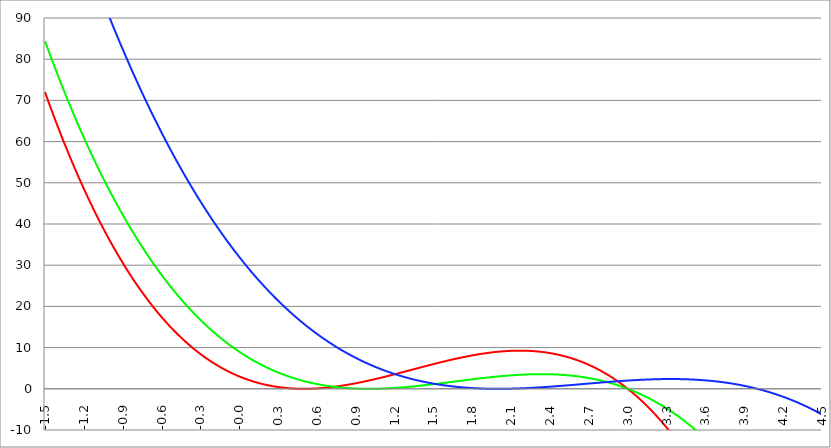
| Category | Series 1 | Series 0 | Series 2 |
|---|---|---|---|
| -1.5 | 72 | 84.375 | 134.75 |
| -1.497 | 71.736 | 84.117 | 134.446 |
| -1.494 | 71.473 | 83.859 | 134.142 |
| -1.491 | 71.211 | 83.601 | 133.839 |
| -1.488 | 70.949 | 83.344 | 133.536 |
| -1.485000000000001 | 70.688 | 83.088 | 133.233 |
| -1.482000000000001 | 70.427 | 82.832 | 132.931 |
| -1.479000000000001 | 70.167 | 82.576 | 132.63 |
| -1.476000000000001 | 69.908 | 82.321 | 132.328 |
| -1.473000000000001 | 69.649 | 82.067 | 132.028 |
| -1.470000000000001 | 69.39 | 81.813 | 131.727 |
| -1.467000000000001 | 69.133 | 81.56 | 131.428 |
| -1.464000000000001 | 68.876 | 81.307 | 131.128 |
| -1.461000000000001 | 68.619 | 81.054 | 130.829 |
| -1.458000000000001 | 68.364 | 80.803 | 130.531 |
| -1.455000000000002 | 68.108 | 80.551 | 130.233 |
| -1.452000000000002 | 67.854 | 80.3 | 129.935 |
| -1.449000000000002 | 67.6 | 80.05 | 129.638 |
| -1.446000000000002 | 67.347 | 79.8 | 129.342 |
| -1.443000000000002 | 67.094 | 79.551 | 129.045 |
| -1.440000000000002 | 66.842 | 79.302 | 128.75 |
| -1.437000000000002 | 66.59 | 79.054 | 128.454 |
| -1.434000000000002 | 66.339 | 78.806 | 128.159 |
| -1.431000000000002 | 66.089 | 78.558 | 127.865 |
| -1.428000000000003 | 65.839 | 78.312 | 127.571 |
| -1.425000000000003 | 65.59 | 78.065 | 127.277 |
| -1.422000000000003 | 65.341 | 77.819 | 126.984 |
| -1.419000000000003 | 65.093 | 77.574 | 126.691 |
| -1.416000000000003 | 64.846 | 77.329 | 126.399 |
| -1.413000000000003 | 64.599 | 77.085 | 126.107 |
| -1.410000000000003 | 64.352 | 76.841 | 125.816 |
| -1.407000000000003 | 64.107 | 76.598 | 125.525 |
| -1.404000000000003 | 63.862 | 76.355 | 125.235 |
| -1.401000000000004 | 63.617 | 76.113 | 124.945 |
| -1.398000000000004 | 63.373 | 75.871 | 124.655 |
| -1.395000000000004 | 63.13 | 75.629 | 124.366 |
| -1.392000000000004 | 62.888 | 75.389 | 124.077 |
| -1.389000000000004 | 62.645 | 75.148 | 123.789 |
| -1.386000000000004 | 62.404 | 74.908 | 123.501 |
| -1.383000000000004 | 62.163 | 74.669 | 123.214 |
| -1.380000000000004 | 61.923 | 74.43 | 122.927 |
| -1.377000000000004 | 61.683 | 74.192 | 122.64 |
| -1.374000000000004 | 61.444 | 73.954 | 122.354 |
| -1.371000000000005 | 61.205 | 73.717 | 122.068 |
| -1.368000000000005 | 60.967 | 73.48 | 121.783 |
| -1.365000000000005 | 60.73 | 73.243 | 121.498 |
| -1.362000000000005 | 60.493 | 73.007 | 121.214 |
| -1.359000000000005 | 60.257 | 72.772 | 120.93 |
| -1.356000000000005 | 60.021 | 72.537 | 120.646 |
| -1.353000000000005 | 59.786 | 72.303 | 120.363 |
| -1.350000000000005 | 59.552 | 72.069 | 120.081 |
| -1.347000000000005 | 59.318 | 71.835 | 119.799 |
| -1.344000000000006 | 59.084 | 71.602 | 119.517 |
| -1.341000000000006 | 58.851 | 71.37 | 119.235 |
| -1.338000000000006 | 58.619 | 71.138 | 118.955 |
| -1.335000000000006 | 58.388 | 70.906 | 118.674 |
| -1.332000000000006 | 58.157 | 70.675 | 118.394 |
| -1.329000000000006 | 57.926 | 70.445 | 118.115 |
| -1.326000000000006 | 57.696 | 70.215 | 117.835 |
| -1.323000000000006 | 57.467 | 69.985 | 117.557 |
| -1.320000000000006 | 57.238 | 69.756 | 117.278 |
| -1.317000000000007 | 57.01 | 69.527 | 117 |
| -1.314000000000007 | 56.783 | 69.299 | 116.723 |
| -1.311000000000007 | 56.556 | 69.072 | 116.446 |
| -1.308000000000007 | 56.329 | 68.844 | 116.169 |
| -1.305000000000007 | 56.103 | 68.618 | 115.893 |
| -1.302000000000007 | 55.878 | 68.392 | 115.618 |
| -1.299000000000007 | 55.653 | 68.166 | 115.342 |
| -1.296000000000007 | 55.429 | 67.941 | 115.067 |
| -1.293000000000007 | 55.205 | 67.716 | 114.793 |
| -1.290000000000008 | 54.982 | 67.492 | 114.519 |
| -1.287000000000008 | 54.76 | 67.268 | 114.245 |
| -1.284000000000008 | 54.538 | 67.044 | 113.972 |
| -1.281000000000008 | 54.317 | 66.822 | 113.7 |
| -1.278000000000008 | 54.096 | 66.599 | 113.427 |
| -1.275000000000008 | 53.876 | 66.377 | 113.155 |
| -1.272000000000008 | 53.656 | 66.156 | 112.884 |
| -1.269000000000008 | 53.437 | 65.935 | 112.613 |
| -1.266000000000008 | 53.218 | 65.715 | 112.342 |
| -1.263000000000009 | 53 | 65.495 | 112.072 |
| -1.260000000000009 | 52.783 | 65.275 | 111.802 |
| -1.257000000000009 | 52.566 | 65.056 | 111.533 |
| -1.254000000000009 | 52.35 | 64.838 | 111.264 |
| -1.251000000000009 | 52.134 | 64.619 | 110.996 |
| -1.24800000000001 | 51.919 | 64.402 | 110.728 |
| -1.245000000000009 | 51.705 | 64.185 | 110.46 |
| -1.242000000000009 | 51.49 | 63.968 | 110.193 |
| -1.239000000000009 | 51.277 | 63.752 | 109.926 |
| -1.23600000000001 | 51.064 | 63.536 | 109.66 |
| -1.23300000000001 | 50.852 | 63.321 | 109.394 |
| -1.23000000000001 | 50.64 | 63.106 | 109.128 |
| -1.22700000000001 | 50.429 | 62.892 | 108.863 |
| -1.22400000000001 | 50.218 | 62.678 | 108.598 |
| -1.22100000000001 | 50.008 | 62.465 | 108.334 |
| -1.21800000000001 | 49.798 | 62.252 | 108.07 |
| -1.21500000000001 | 49.589 | 62.039 | 107.807 |
| -1.21200000000001 | 49.381 | 61.827 | 107.544 |
| -1.20900000000001 | 49.173 | 61.616 | 107.281 |
| -1.206000000000011 | 48.965 | 61.405 | 107.019 |
| -1.203000000000011 | 48.758 | 61.194 | 106.757 |
| -1.200000000000011 | 48.552 | 60.984 | 106.496 |
| -1.197000000000011 | 48.346 | 60.774 | 106.235 |
| -1.194000000000011 | 48.141 | 60.565 | 105.975 |
| -1.191000000000011 | 47.936 | 60.356 | 105.715 |
| -1.188000000000011 | 47.732 | 60.148 | 105.455 |
| -1.185000000000011 | 47.529 | 59.94 | 105.196 |
| -1.182000000000011 | 47.326 | 59.733 | 104.937 |
| -1.179000000000012 | 47.123 | 59.526 | 104.678 |
| -1.176000000000012 | 46.921 | 59.32 | 104.42 |
| -1.173000000000012 | 46.72 | 59.114 | 104.163 |
| -1.170000000000012 | 46.519 | 58.908 | 103.906 |
| -1.167000000000012 | 46.319 | 58.703 | 103.649 |
| -1.164000000000012 | 46.119 | 58.499 | 103.393 |
| -1.161000000000012 | 45.919 | 58.295 | 103.137 |
| -1.158000000000012 | 45.721 | 58.091 | 102.881 |
| -1.155000000000012 | 45.523 | 57.888 | 102.626 |
| -1.152000000000013 | 45.325 | 57.685 | 102.371 |
| -1.149000000000013 | 45.128 | 57.483 | 102.117 |
| -1.146000000000013 | 44.931 | 57.281 | 101.863 |
| -1.143000000000013 | 44.735 | 57.08 | 101.61 |
| -1.140000000000013 | 44.54 | 56.879 | 101.357 |
| -1.137000000000013 | 44.345 | 56.678 | 101.104 |
| -1.134000000000013 | 44.15 | 56.478 | 100.852 |
| -1.131000000000013 | 43.957 | 56.279 | 100.6 |
| -1.128000000000013 | 43.763 | 56.08 | 100.349 |
| -1.125000000000014 | 43.57 | 55.881 | 100.098 |
| -1.122000000000014 | 43.378 | 55.683 | 99.847 |
| -1.119000000000014 | 43.186 | 55.485 | 99.597 |
| -1.116000000000014 | 42.995 | 55.288 | 99.347 |
| -1.113000000000014 | 42.804 | 55.091 | 99.098 |
| -1.110000000000014 | 42.614 | 54.894 | 98.849 |
| -1.107000000000014 | 42.424 | 54.698 | 98.6 |
| -1.104000000000014 | 42.235 | 54.503 | 98.352 |
| -1.101000000000014 | 42.047 | 54.308 | 98.104 |
| -1.098000000000014 | 41.859 | 54.113 | 97.857 |
| -1.095000000000015 | 41.671 | 53.919 | 97.61 |
| -1.092000000000015 | 41.484 | 53.725 | 97.364 |
| -1.089000000000015 | 41.298 | 53.532 | 97.118 |
| -1.086000000000015 | 41.112 | 53.339 | 96.872 |
| -1.083000000000015 | 40.926 | 53.147 | 96.627 |
| -1.080000000000015 | 40.741 | 52.955 | 96.382 |
| -1.077000000000015 | 40.557 | 52.764 | 96.137 |
| -1.074000000000015 | 40.373 | 52.573 | 95.893 |
| -1.071000000000015 | 40.19 | 52.382 | 95.65 |
| -1.068000000000016 | 40.007 | 52.192 | 95.406 |
| -1.065000000000016 | 39.824 | 52.002 | 95.163 |
| -1.062000000000016 | 39.643 | 51.813 | 94.921 |
| -1.059000000000016 | 39.461 | 51.624 | 94.679 |
| -1.056000000000016 | 39.281 | 51.436 | 94.437 |
| -1.053000000000016 | 39.1 | 51.248 | 94.196 |
| -1.050000000000016 | 38.921 | 51.06 | 93.955 |
| -1.047000000000016 | 38.741 | 50.873 | 93.715 |
| -1.044000000000016 | 38.563 | 50.687 | 93.475 |
| -1.041000000000017 | 38.384 | 50.501 | 93.235 |
| -1.038000000000017 | 38.207 | 50.315 | 92.996 |
| -1.035000000000017 | 38.029 | 50.13 | 92.757 |
| -1.032000000000017 | 37.853 | 49.945 | 92.519 |
| -1.029000000000017 | 37.677 | 49.76 | 92.281 |
| -1.026000000000017 | 37.501 | 49.576 | 92.043 |
| -1.023000000000017 | 37.326 | 49.393 | 91.806 |
| -1.020000000000017 | 37.151 | 49.21 | 91.569 |
| -1.017000000000017 | 36.977 | 49.027 | 91.332 |
| -1.014000000000018 | 36.803 | 48.845 | 91.096 |
| -1.011000000000018 | 36.63 | 48.663 | 90.861 |
| -1.008000000000018 | 36.458 | 48.482 | 90.625 |
| -1.005000000000018 | 36.286 | 48.301 | 90.391 |
| -1.002000000000018 | 36.114 | 48.12 | 90.156 |
| -0.999000000000018 | 35.943 | 47.94 | 89.922 |
| -0.996000000000018 | 35.772 | 47.76 | 89.688 |
| -0.993000000000018 | 35.602 | 47.581 | 89.455 |
| -0.990000000000018 | 35.433 | 47.402 | 89.222 |
| -0.987000000000018 | 35.264 | 47.224 | 88.99 |
| -0.984000000000018 | 35.095 | 47.046 | 88.758 |
| -0.981000000000018 | 34.927 | 46.869 | 88.526 |
| -0.978000000000018 | 34.76 | 46.692 | 88.295 |
| -0.975000000000018 | 34.592 | 46.515 | 88.064 |
| -0.972000000000018 | 34.426 | 46.339 | 87.833 |
| -0.969000000000018 | 34.26 | 46.163 | 87.603 |
| -0.966000000000018 | 34.094 | 45.988 | 87.373 |
| -0.963000000000018 | 33.929 | 45.813 | 87.144 |
| -0.960000000000018 | 33.765 | 45.638 | 86.915 |
| -0.957000000000018 | 33.6 | 45.464 | 86.687 |
| -0.954000000000018 | 33.437 | 45.29 | 86.458 |
| -0.951000000000018 | 33.274 | 45.117 | 86.231 |
| -0.948000000000018 | 33.111 | 44.944 | 86.003 |
| -0.945000000000018 | 32.949 | 44.772 | 85.776 |
| -0.942000000000018 | 32.787 | 44.6 | 85.55 |
| -0.939000000000018 | 32.626 | 44.429 | 85.323 |
| -0.936000000000018 | 32.466 | 44.258 | 85.098 |
| -0.933000000000018 | 32.305 | 44.087 | 84.872 |
| -0.930000000000018 | 32.146 | 43.917 | 84.647 |
| -0.927000000000018 | 31.987 | 43.747 | 84.422 |
| -0.924000000000018 | 31.828 | 43.577 | 84.198 |
| -0.921000000000018 | 31.67 | 43.408 | 83.974 |
| -0.918000000000018 | 31.512 | 43.24 | 83.751 |
| -0.915000000000018 | 31.355 | 43.072 | 83.528 |
| -0.912000000000018 | 31.198 | 42.904 | 83.305 |
| -0.909000000000018 | 31.042 | 42.736 | 83.083 |
| -0.906000000000018 | 30.886 | 42.57 | 82.861 |
| -0.903000000000018 | 30.731 | 42.403 | 82.639 |
| -0.900000000000018 | 30.576 | 42.237 | 82.418 |
| -0.897000000000018 | 30.422 | 42.071 | 82.197 |
| -0.894000000000018 | 30.268 | 41.906 | 81.977 |
| -0.891000000000018 | 30.114 | 41.741 | 81.757 |
| -0.888000000000018 | 29.962 | 41.577 | 81.537 |
| -0.885000000000018 | 29.809 | 41.413 | 81.318 |
| -0.882000000000018 | 29.657 | 41.249 | 81.099 |
| -0.879000000000018 | 29.506 | 41.086 | 80.881 |
| -0.876000000000018 | 29.355 | 40.923 | 80.662 |
| -0.873000000000018 | 29.204 | 40.761 | 80.445 |
| -0.870000000000018 | 29.054 | 40.599 | 80.227 |
| -0.867000000000018 | 28.905 | 40.437 | 80.01 |
| -0.864000000000018 | 28.756 | 40.276 | 79.794 |
| -0.861000000000018 | 28.607 | 40.116 | 79.578 |
| -0.858000000000018 | 28.459 | 39.955 | 79.362 |
| -0.855000000000018 | 28.312 | 39.795 | 79.146 |
| -0.852000000000018 | 28.164 | 39.636 | 78.931 |
| -0.849000000000018 | 28.018 | 39.477 | 78.717 |
| -0.846000000000018 | 27.871 | 39.318 | 78.502 |
| -0.843000000000018 | 27.726 | 39.16 | 78.289 |
| -0.840000000000018 | 27.58 | 39.002 | 78.075 |
| -0.837000000000018 | 27.436 | 38.845 | 77.862 |
| -0.834000000000018 | 27.291 | 38.688 | 77.649 |
| -0.831000000000018 | 27.147 | 38.531 | 77.437 |
| -0.828000000000018 | 27.004 | 38.375 | 77.225 |
| -0.825000000000018 | 26.861 | 38.219 | 77.013 |
| -0.822000000000018 | 26.719 | 38.063 | 76.802 |
| -0.819000000000018 | 26.577 | 37.908 | 76.591 |
| -0.816000000000018 | 26.435 | 37.754 | 76.38 |
| -0.813000000000018 | 26.294 | 37.6 | 76.17 |
| -0.810000000000018 | 26.153 | 37.446 | 75.96 |
| -0.807000000000018 | 26.013 | 37.292 | 75.751 |
| -0.804000000000018 | 25.874 | 37.139 | 75.542 |
| -0.801000000000018 | 25.734 | 36.987 | 75.333 |
| -0.798000000000018 | 25.596 | 36.835 | 75.125 |
| -0.795000000000018 | 25.457 | 36.683 | 74.917 |
| -0.792000000000018 | 25.319 | 36.531 | 74.71 |
| -0.789000000000018 | 25.182 | 36.38 | 74.503 |
| -0.786000000000018 | 25.045 | 36.23 | 74.296 |
| -0.783000000000018 | 24.909 | 36.079 | 74.09 |
| -0.780000000000018 | 24.773 | 35.93 | 73.884 |
| -0.777000000000018 | 24.637 | 35.78 | 73.678 |
| -0.774000000000018 | 24.502 | 35.631 | 73.473 |
| -0.771000000000018 | 24.367 | 35.483 | 73.268 |
| -0.768000000000018 | 24.233 | 35.334 | 73.063 |
| -0.765000000000018 | 24.099 | 35.186 | 72.859 |
| -0.762000000000018 | 23.966 | 35.039 | 72.655 |
| -0.759000000000018 | 23.833 | 34.892 | 72.452 |
| -0.756000000000018 | 23.701 | 34.745 | 72.249 |
| -0.753000000000018 | 23.569 | 34.599 | 72.046 |
| -0.750000000000018 | 23.438 | 34.453 | 71.844 |
| -0.747000000000018 | 23.306 | 34.308 | 71.642 |
| -0.744000000000018 | 23.176 | 34.163 | 71.44 |
| -0.741000000000018 | 23.046 | 34.018 | 71.239 |
| -0.738000000000018 | 22.916 | 33.874 | 71.038 |
| -0.735000000000018 | 22.787 | 33.73 | 70.838 |
| -0.732000000000018 | 22.658 | 33.586 | 70.638 |
| -0.729000000000018 | 22.53 | 33.443 | 70.438 |
| -0.726000000000018 | 22.402 | 33.3 | 70.239 |
| -0.723000000000018 | 22.274 | 33.158 | 70.04 |
| -0.720000000000018 | 22.147 | 33.016 | 69.841 |
| -0.717000000000018 | 22.021 | 32.874 | 69.643 |
| -0.714000000000018 | 21.895 | 32.733 | 69.445 |
| -0.711000000000018 | 21.769 | 32.592 | 69.247 |
| -0.708000000000018 | 21.644 | 32.452 | 69.05 |
| -0.705000000000018 | 21.519 | 32.312 | 68.853 |
| -0.702000000000018 | 21.395 | 32.172 | 68.657 |
| -0.699000000000018 | 21.271 | 32.033 | 68.461 |
| -0.696000000000018 | 21.147 | 31.894 | 68.265 |
| -0.693000000000018 | 21.024 | 31.755 | 68.07 |
| -0.690000000000018 | 20.902 | 31.617 | 67.875 |
| -0.687000000000018 | 20.779 | 31.479 | 67.68 |
| -0.684000000000018 | 20.658 | 31.342 | 67.486 |
| -0.681000000000018 | 20.536 | 31.205 | 67.292 |
| -0.678000000000018 | 20.416 | 31.068 | 67.098 |
| -0.675000000000018 | 20.295 | 30.932 | 66.905 |
| -0.672000000000018 | 20.175 | 30.796 | 66.712 |
| -0.669000000000018 | 20.056 | 30.661 | 66.52 |
| -0.666000000000018 | 19.937 | 30.526 | 66.328 |
| -0.663000000000018 | 19.818 | 30.391 | 66.136 |
| -0.660000000000018 | 19.7 | 30.256 | 65.945 |
| -0.657000000000018 | 19.582 | 30.123 | 65.754 |
| -0.654000000000018 | 19.464 | 29.989 | 65.563 |
| -0.651000000000018 | 19.347 | 29.856 | 65.373 |
| -0.648000000000018 | 19.231 | 29.723 | 65.183 |
| -0.645000000000018 | 19.115 | 29.59 | 64.993 |
| -0.642000000000018 | 18.999 | 29.458 | 64.804 |
| -0.639000000000018 | 18.884 | 29.327 | 64.615 |
| -0.636000000000018 | 18.769 | 29.195 | 64.426 |
| -0.633000000000018 | 18.655 | 29.064 | 64.238 |
| -0.630000000000018 | 18.541 | 28.934 | 64.05 |
| -0.627000000000018 | 18.427 | 28.803 | 63.863 |
| -0.624000000000018 | 18.314 | 28.674 | 63.676 |
| -0.621000000000018 | 18.201 | 28.544 | 63.489 |
| -0.618000000000018 | 18.089 | 28.415 | 63.303 |
| -0.615000000000018 | 17.977 | 28.286 | 63.117 |
| -0.612000000000018 | 17.866 | 28.158 | 62.931 |
| -0.609000000000018 | 17.755 | 28.03 | 62.746 |
| -0.606000000000018 | 17.644 | 27.902 | 62.561 |
| -0.603000000000018 | 17.534 | 27.775 | 62.376 |
| -0.600000000000018 | 17.424 | 27.648 | 62.192 |
| -0.597000000000018 | 17.315 | 27.521 | 62.008 |
| -0.594000000000018 | 17.206 | 27.395 | 61.825 |
| -0.591000000000018 | 17.097 | 27.269 | 61.641 |
| -0.588000000000018 | 16.989 | 27.144 | 61.458 |
| -0.585000000000018 | 16.881 | 27.019 | 61.276 |
| -0.582000000000018 | 16.774 | 26.894 | 61.094 |
| -0.579000000000018 | 16.667 | 26.77 | 60.912 |
| -0.576000000000018 | 16.561 | 26.646 | 60.731 |
| -0.573000000000018 | 16.455 | 26.522 | 60.55 |
| -0.570000000000018 | 16.349 | 26.399 | 60.369 |
| -0.567000000000018 | 16.244 | 26.276 | 60.188 |
| -0.564000000000018 | 16.139 | 26.154 | 60.008 |
| -0.561000000000018 | 16.035 | 26.031 | 59.829 |
| -0.558000000000018 | 15.931 | 25.91 | 59.649 |
| -0.555000000000018 | 15.827 | 25.788 | 59.47 |
| -0.552000000000018 | 15.724 | 25.667 | 59.292 |
| -0.549000000000018 | 15.621 | 25.546 | 59.113 |
| -0.546000000000018 | 15.519 | 25.426 | 58.935 |
| -0.543000000000018 | 15.417 | 25.306 | 58.758 |
| -0.540000000000018 | 15.315 | 25.186 | 58.581 |
| -0.537000000000018 | 15.214 | 25.067 | 58.404 |
| -0.534000000000018 | 15.114 | 24.948 | 58.227 |
| -0.531000000000018 | 15.013 | 24.83 | 58.051 |
| -0.528000000000018 | 14.913 | 24.711 | 57.875 |
| -0.525000000000018 | 14.814 | 24.593 | 57.699 |
| -0.522000000000018 | 14.715 | 24.476 | 57.524 |
| -0.519000000000018 | 14.616 | 24.359 | 57.349 |
| -0.516000000000018 | 14.518 | 24.242 | 57.175 |
| -0.513000000000018 | 14.42 | 24.126 | 57.001 |
| -0.510000000000018 | 14.322 | 24.009 | 56.827 |
| -0.507000000000018 | 14.225 | 23.894 | 56.653 |
| -0.504000000000018 | 14.128 | 23.778 | 56.48 |
| -0.501000000000018 | 14.032 | 23.663 | 56.308 |
| -0.498000000000017 | 13.936 | 23.549 | 56.135 |
| -0.495000000000017 | 13.841 | 23.434 | 55.963 |
| -0.492000000000017 | 13.745 | 23.32 | 55.791 |
| -0.489000000000017 | 13.651 | 23.207 | 55.62 |
| -0.486000000000017 | 13.556 | 23.093 | 55.449 |
| -0.483000000000017 | 13.462 | 22.98 | 55.278 |
| -0.480000000000017 | 13.369 | 22.868 | 55.108 |
| -0.477000000000017 | 13.276 | 22.756 | 54.938 |
| -0.474000000000017 | 13.183 | 22.644 | 54.768 |
| -0.471000000000017 | 13.09 | 22.532 | 54.598 |
| -0.468000000000017 | 12.998 | 22.421 | 54.429 |
| -0.465000000000017 | 12.907 | 22.31 | 54.261 |
| -0.462000000000017 | 12.816 | 22.199 | 54.092 |
| -0.459000000000017 | 12.725 | 22.089 | 53.924 |
| -0.456000000000017 | 12.634 | 21.979 | 53.757 |
| -0.453000000000017 | 12.544 | 21.87 | 53.589 |
| -0.450000000000017 | 12.455 | 21.761 | 53.422 |
| -0.447000000000017 | 12.365 | 21.652 | 53.256 |
| -0.444000000000017 | 12.276 | 21.544 | 53.089 |
| -0.441000000000017 | 12.188 | 21.436 | 52.923 |
| -0.438000000000017 | 12.1 | 21.328 | 52.758 |
| -0.435000000000017 | 12.012 | 21.22 | 52.592 |
| -0.432000000000017 | 11.924 | 21.113 | 52.427 |
| -0.429000000000017 | 11.837 | 21.006 | 52.263 |
| -0.426000000000017 | 11.751 | 20.9 | 52.098 |
| -0.423000000000017 | 11.665 | 20.794 | 51.934 |
| -0.420000000000017 | 11.579 | 20.688 | 51.771 |
| -0.417000000000017 | 11.493 | 20.583 | 51.607 |
| -0.414000000000017 | 11.408 | 20.478 | 51.444 |
| -0.411000000000017 | 11.323 | 20.373 | 51.282 |
| -0.408000000000017 | 11.239 | 20.269 | 51.119 |
| -0.405000000000017 | 11.155 | 20.165 | 50.957 |
| -0.402000000000017 | 11.072 | 20.061 | 50.796 |
| -0.399000000000017 | 10.988 | 19.958 | 50.634 |
| -0.396000000000017 | 10.905 | 19.855 | 50.473 |
| -0.393000000000017 | 10.823 | 19.752 | 50.313 |
| -0.390000000000017 | 10.741 | 19.649 | 50.152 |
| -0.387000000000017 | 10.659 | 19.547 | 49.992 |
| -0.384000000000017 | 10.578 | 19.446 | 49.833 |
| -0.381000000000017 | 10.497 | 19.344 | 49.673 |
| -0.378000000000017 | 10.416 | 19.243 | 49.514 |
| -0.375000000000017 | 10.336 | 19.143 | 49.355 |
| -0.372000000000017 | 10.256 | 19.042 | 49.197 |
| -0.369000000000017 | 10.177 | 18.942 | 49.039 |
| -0.366000000000017 | 10.097 | 18.842 | 48.881 |
| -0.363000000000017 | 10.019 | 18.743 | 48.724 |
| -0.360000000000017 | 9.94 | 18.644 | 48.567 |
| -0.357000000000017 | 9.862 | 18.545 | 48.41 |
| -0.354000000000017 | 9.785 | 18.447 | 48.254 |
| -0.351000000000017 | 9.707 | 18.349 | 48.098 |
| -0.348000000000017 | 9.63 | 18.251 | 47.942 |
| -0.345000000000017 | 9.554 | 18.154 | 47.787 |
| -0.342000000000017 | 9.477 | 18.056 | 47.631 |
| -0.339000000000017 | 9.402 | 17.96 | 47.477 |
| -0.336000000000017 | 9.326 | 17.863 | 47.322 |
| -0.333000000000017 | 9.251 | 17.767 | 47.168 |
| -0.330000000000017 | 9.176 | 17.671 | 47.014 |
| -0.327000000000017 | 9.102 | 17.576 | 46.861 |
| -0.324000000000017 | 9.028 | 17.481 | 46.708 |
| -0.321000000000017 | 8.954 | 17.386 | 46.555 |
| -0.318000000000017 | 8.881 | 17.291 | 46.402 |
| -0.315000000000017 | 8.808 | 17.197 | 46.25 |
| -0.312000000000017 | 8.735 | 17.103 | 46.098 |
| -0.309000000000017 | 8.663 | 17.01 | 45.947 |
| -0.306000000000017 | 8.591 | 16.916 | 45.795 |
| -0.303000000000017 | 8.519 | 16.824 | 45.645 |
| -0.300000000000017 | 8.448 | 16.731 | 45.494 |
| -0.297000000000017 | 8.377 | 16.639 | 45.344 |
| -0.294000000000017 | 8.307 | 16.547 | 45.194 |
| -0.291000000000017 | 8.236 | 16.455 | 45.044 |
| -0.288000000000017 | 8.167 | 16.364 | 44.895 |
| -0.285000000000017 | 8.097 | 16.273 | 44.746 |
| -0.282000000000017 | 8.028 | 16.182 | 44.597 |
| -0.279000000000017 | 7.959 | 16.092 | 44.449 |
| -0.276000000000017 | 7.891 | 16.002 | 44.301 |
| -0.273000000000017 | 7.823 | 15.912 | 44.153 |
| -0.270000000000017 | 7.755 | 15.823 | 44.006 |
| -0.267000000000017 | 7.688 | 15.733 | 43.859 |
| -0.264000000000017 | 7.621 | 15.645 | 43.712 |
| -0.261000000000017 | 7.554 | 15.556 | 43.565 |
| -0.258000000000017 | 7.488 | 15.468 | 43.419 |
| -0.255000000000017 | 7.422 | 15.38 | 43.274 |
| -0.252000000000017 | 7.356 | 15.293 | 43.128 |
| -0.249000000000017 | 7.291 | 15.205 | 42.983 |
| -0.246000000000017 | 7.226 | 15.118 | 42.838 |
| -0.243000000000017 | 7.161 | 15.032 | 42.693 |
| -0.240000000000017 | 7.097 | 14.945 | 42.549 |
| -0.237000000000017 | 7.033 | 14.859 | 42.405 |
| -0.234000000000017 | 6.969 | 14.774 | 42.262 |
| -0.231000000000017 | 6.906 | 14.688 | 42.118 |
| -0.228000000000017 | 6.843 | 14.603 | 41.975 |
| -0.225000000000017 | 6.781 | 14.519 | 41.833 |
| -0.222000000000017 | 6.718 | 14.434 | 41.69 |
| -0.219000000000017 | 6.656 | 14.35 | 41.548 |
| -0.216000000000017 | 6.595 | 14.266 | 41.407 |
| -0.213000000000017 | 6.534 | 14.183 | 41.265 |
| -0.210000000000017 | 6.473 | 14.099 | 41.124 |
| -0.207000000000017 | 6.412 | 14.016 | 40.983 |
| -0.204000000000017 | 6.352 | 13.934 | 40.843 |
| -0.201000000000017 | 6.292 | 13.851 | 40.703 |
| -0.198000000000017 | 6.232 | 13.769 | 40.563 |
| -0.195000000000017 | 6.173 | 13.688 | 40.423 |
| -0.192000000000017 | 6.114 | 13.606 | 40.284 |
| -0.189000000000017 | 6.056 | 13.525 | 40.145 |
| -0.186000000000017 | 5.997 | 13.444 | 40.006 |
| -0.183000000000017 | 5.939 | 13.364 | 39.868 |
| -0.180000000000017 | 5.882 | 13.283 | 39.73 |
| -0.177000000000017 | 5.824 | 13.204 | 39.592 |
| -0.174000000000017 | 5.767 | 13.124 | 39.455 |
| -0.171000000000017 | 5.711 | 13.045 | 39.318 |
| -0.168000000000017 | 5.655 | 12.966 | 39.181 |
| -0.165000000000017 | 5.599 | 12.887 | 39.045 |
| -0.162000000000017 | 5.543 | 12.808 | 38.908 |
| -0.159000000000017 | 5.488 | 12.73 | 38.773 |
| -0.156000000000017 | 5.433 | 12.652 | 38.637 |
| -0.153000000000017 | 5.378 | 12.575 | 38.502 |
| -0.150000000000017 | 5.324 | 12.498 | 38.367 |
| -0.147000000000017 | 5.269 | 12.421 | 38.232 |
| -0.144000000000017 | 5.216 | 12.344 | 38.098 |
| -0.141000000000017 | 5.162 | 12.268 | 37.964 |
| -0.138000000000017 | 5.109 | 12.192 | 37.83 |
| -0.135000000000017 | 5.056 | 12.116 | 37.697 |
| -0.132000000000017 | 5.004 | 12.04 | 37.563 |
| -0.129000000000017 | 4.952 | 11.965 | 37.431 |
| -0.126000000000017 | 4.9 | 11.89 | 37.298 |
| -0.123000000000017 | 4.849 | 11.816 | 37.166 |
| -0.120000000000017 | 4.797 | 11.741 | 37.034 |
| -0.117000000000017 | 4.746 | 11.667 | 36.902 |
| -0.114000000000017 | 4.696 | 11.593 | 36.771 |
| -0.111000000000017 | 4.646 | 11.52 | 36.64 |
| -0.108000000000017 | 4.596 | 11.447 | 36.509 |
| -0.105000000000017 | 4.546 | 11.374 | 36.379 |
| -0.102000000000017 | 4.497 | 11.301 | 36.249 |
| -0.0990000000000172 | 4.448 | 11.229 | 36.119 |
| -0.0960000000000172 | 4.399 | 11.157 | 35.989 |
| -0.0930000000000172 | 4.351 | 11.085 | 35.86 |
| -0.0900000000000172 | 4.303 | 11.014 | 35.731 |
| -0.0870000000000172 | 4.255 | 10.943 | 35.602 |
| -0.0840000000000172 | 4.207 | 10.872 | 35.474 |
| -0.0810000000000172 | 4.16 | 10.801 | 35.346 |
| -0.0780000000000172 | 4.113 | 10.731 | 35.218 |
| -0.0750000000000172 | 4.067 | 10.661 | 35.091 |
| -0.0720000000000172 | 4.02 | 10.591 | 34.964 |
| -0.0690000000000171 | 3.974 | 10.521 | 34.837 |
| -0.0660000000000171 | 3.929 | 10.452 | 34.71 |
| -0.0630000000000171 | 3.884 | 10.383 | 34.584 |
| -0.0600000000000171 | 3.838 | 10.315 | 34.458 |
| -0.0570000000000171 | 3.794 | 10.246 | 34.332 |
| -0.0540000000000171 | 3.749 | 10.178 | 34.207 |
| -0.0510000000000171 | 3.705 | 10.11 | 34.082 |
| -0.0480000000000171 | 3.661 | 10.043 | 33.957 |
| -0.0450000000000171 | 3.618 | 9.976 | 33.833 |
| -0.0420000000000171 | 3.575 | 9.909 | 33.708 |
| -0.0390000000000171 | 3.532 | 9.842 | 33.584 |
| -0.0360000000000171 | 3.489 | 9.776 | 33.461 |
| -0.0330000000000171 | 3.447 | 9.709 | 33.337 |
| -0.0300000000000171 | 3.405 | 9.644 | 33.214 |
| -0.0270000000000171 | 3.363 | 9.578 | 33.092 |
| -0.0240000000000171 | 3.321 | 9.513 | 32.969 |
| -0.0210000000000171 | 3.28 | 9.448 | 32.847 |
| -0.0180000000000171 | 3.239 | 9.383 | 32.725 |
| -0.0150000000000171 | 3.199 | 9.318 | 32.604 |
| -0.0120000000000171 | 3.158 | 9.254 | 32.482 |
| -0.00900000000001713 | 3.118 | 9.19 | 32.361 |
| -0.00600000000001713 | 3.079 | 9.127 | 32.241 |
| -0.00300000000001713 | 3.039 | 9.063 | 32.12 |
| -1.71329964104849e-14 | 3 | 9 | 32 |
| 0.00299999999998287 | 2.961 | 8.937 | 31.88 |
| 0.00599999999998287 | 2.923 | 8.875 | 31.761 |
| 0.00899999999998286 | 2.884 | 8.812 | 31.641 |
| 0.0119999999999829 | 2.846 | 8.75 | 31.522 |
| 0.0149999999999829 | 2.809 | 8.688 | 31.404 |
| 0.0179999999999829 | 2.771 | 8.627 | 31.285 |
| 0.0209999999999829 | 2.734 | 8.566 | 31.167 |
| 0.0239999999999829 | 2.697 | 8.505 | 31.049 |
| 0.0269999999999829 | 2.661 | 8.444 | 30.932 |
| 0.0299999999999829 | 2.624 | 8.383 | 30.814 |
| 0.0329999999999829 | 2.588 | 8.323 | 30.697 |
| 0.0359999999999829 | 2.553 | 8.263 | 30.581 |
| 0.0389999999999829 | 2.517 | 8.204 | 30.464 |
| 0.0419999999999829 | 2.482 | 8.144 | 30.348 |
| 0.0449999999999829 | 2.447 | 8.085 | 30.232 |
| 0.0479999999999829 | 2.412 | 8.026 | 30.117 |
| 0.0509999999999829 | 2.378 | 7.968 | 30.001 |
| 0.0539999999999829 | 2.344 | 7.909 | 29.886 |
| 0.0569999999999829 | 2.31 | 7.851 | 29.772 |
| 0.0599999999999829 | 2.277 | 7.793 | 29.657 |
| 0.0629999999999829 | 2.244 | 7.736 | 29.543 |
| 0.0659999999999829 | 2.211 | 7.678 | 29.429 |
| 0.0689999999999829 | 2.178 | 7.621 | 29.316 |
| 0.0719999999999829 | 2.145 | 7.565 | 29.202 |
| 0.0749999999999829 | 2.113 | 7.508 | 29.089 |
| 0.0779999999999829 | 2.081 | 7.452 | 28.976 |
| 0.0809999999999829 | 2.05 | 7.396 | 28.864 |
| 0.0839999999999829 | 2.019 | 7.34 | 28.752 |
| 0.0869999999999829 | 1.987 | 7.285 | 28.64 |
| 0.0899999999999829 | 1.957 | 7.229 | 28.528 |
| 0.0929999999999829 | 1.926 | 7.174 | 28.417 |
| 0.0959999999999829 | 1.896 | 7.12 | 28.306 |
| 0.0989999999999829 | 1.866 | 7.065 | 28.195 |
| 0.101999999999983 | 1.836 | 7.011 | 28.084 |
| 0.104999999999983 | 1.807 | 6.957 | 27.974 |
| 0.107999999999983 | 1.778 | 6.903 | 27.864 |
| 0.110999999999983 | 1.749 | 6.85 | 27.754 |
| 0.113999999999983 | 1.72 | 6.796 | 27.645 |
| 0.116999999999983 | 1.692 | 6.744 | 27.536 |
| 0.119999999999983 | 1.663 | 6.691 | 27.427 |
| 0.122999999999983 | 1.636 | 6.638 | 27.318 |
| 0.125999999999983 | 1.608 | 6.586 | 27.21 |
| 0.128999999999983 | 1.581 | 6.534 | 27.102 |
| 0.131999999999983 | 1.554 | 6.482 | 26.994 |
| 0.134999999999983 | 1.527 | 6.431 | 26.887 |
| 0.137999999999983 | 1.5 | 6.38 | 26.779 |
| 0.140999999999983 | 1.474 | 6.329 | 26.672 |
| 0.143999999999983 | 1.448 | 6.278 | 26.566 |
| 0.146999999999983 | 1.422 | 6.228 | 26.459 |
| 0.149999999999983 | 1.397 | 6.177 | 26.353 |
| 0.152999999999983 | 1.371 | 6.127 | 26.247 |
| 0.155999999999983 | 1.346 | 6.078 | 26.142 |
| 0.158999999999983 | 1.321 | 6.028 | 26.036 |
| 0.161999999999983 | 1.297 | 5.979 | 25.931 |
| 0.164999999999983 | 1.273 | 5.93 | 25.827 |
| 0.167999999999983 | 1.249 | 5.881 | 25.722 |
| 0.170999999999983 | 1.225 | 5.833 | 25.618 |
| 0.173999999999983 | 1.201 | 5.784 | 25.514 |
| 0.176999999999983 | 1.178 | 5.736 | 25.41 |
| 0.179999999999983 | 1.155 | 5.689 | 25.307 |
| 0.182999999999983 | 1.132 | 5.641 | 25.204 |
| 0.185999999999983 | 1.11 | 5.594 | 25.101 |
| 0.188999999999983 | 1.088 | 5.547 | 24.998 |
| 0.191999999999983 | 1.066 | 5.5 | 24.896 |
| 0.194999999999983 | 1.044 | 5.453 | 24.794 |
| 0.197999999999983 | 1.022 | 5.407 | 24.692 |
| 0.200999999999983 | 1.001 | 5.361 | 24.59 |
| 0.203999999999983 | 0.98 | 5.315 | 24.489 |
| 0.206999999999983 | 0.959 | 5.269 | 24.388 |
| 0.209999999999983 | 0.939 | 5.224 | 24.287 |
| 0.212999999999983 | 0.918 | 5.179 | 24.187 |
| 0.215999999999983 | 0.898 | 5.134 | 24.086 |
| 0.218999999999983 | 0.878 | 5.089 | 23.986 |
| 0.221999999999983 | 0.859 | 5.044 | 23.887 |
| 0.224999999999983 | 0.839 | 5 | 23.787 |
| 0.227999999999983 | 0.82 | 4.956 | 23.688 |
| 0.230999999999983 | 0.801 | 4.912 | 23.589 |
| 0.233999999999983 | 0.783 | 4.869 | 23.49 |
| 0.236999999999983 | 0.764 | 4.826 | 23.392 |
| 0.239999999999983 | 0.746 | 4.783 | 23.294 |
| 0.242999999999983 | 0.728 | 4.74 | 23.196 |
| 0.245999999999983 | 0.711 | 4.697 | 23.098 |
| 0.248999999999983 | 0.693 | 4.655 | 23.001 |
| 0.251999999999983 | 0.676 | 4.613 | 22.904 |
| 0.254999999999983 | 0.659 | 4.571 | 22.807 |
| 0.257999999999983 | 0.642 | 4.529 | 22.711 |
| 0.260999999999983 | 0.626 | 4.487 | 22.614 |
| 0.263999999999983 | 0.61 | 4.446 | 22.518 |
| 0.266999999999983 | 0.593 | 4.405 | 22.423 |
| 0.269999999999983 | 0.578 | 4.364 | 22.327 |
| 0.272999999999983 | 0.562 | 4.324 | 22.232 |
| 0.275999999999983 | 0.547 | 4.284 | 22.137 |
| 0.278999999999983 | 0.532 | 4.243 | 22.042 |
| 0.281999999999983 | 0.517 | 4.204 | 21.948 |
| 0.284999999999983 | 0.502 | 4.164 | 21.853 |
| 0.287999999999983 | 0.488 | 4.124 | 21.759 |
| 0.290999999999983 | 0.473 | 4.085 | 21.666 |
| 0.293999999999983 | 0.459 | 4.046 | 21.572 |
| 0.296999999999983 | 0.446 | 4.008 | 21.479 |
| 0.299999999999983 | 0.432 | 3.969 | 21.386 |
| 0.302999999999983 | 0.419 | 3.931 | 21.293 |
| 0.305999999999983 | 0.406 | 3.893 | 21.201 |
| 0.308999999999983 | 0.393 | 3.855 | 21.109 |
| 0.311999999999983 | 0.38 | 3.817 | 21.017 |
| 0.314999999999983 | 0.368 | 3.78 | 20.925 |
| 0.317999999999983 | 0.355 | 3.742 | 20.834 |
| 0.320999999999983 | 0.343 | 3.705 | 20.743 |
| 0.323999999999983 | 0.332 | 3.669 | 20.652 |
| 0.326999999999983 | 0.32 | 3.632 | 20.561 |
| 0.329999999999983 | 0.309 | 3.596 | 20.471 |
| 0.332999999999983 | 0.298 | 3.56 | 20.38 |
| 0.335999999999983 | 0.287 | 3.524 | 20.29 |
| 0.338999999999983 | 0.276 | 3.488 | 20.201 |
| 0.341999999999983 | 0.265 | 3.452 | 20.111 |
| 0.344999999999983 | 0.255 | 3.417 | 20.022 |
| 0.347999999999983 | 0.245 | 3.382 | 19.933 |
| 0.350999999999983 | 0.235 | 3.347 | 19.845 |
| 0.353999999999983 | 0.226 | 3.313 | 19.756 |
| 0.356999999999983 | 0.216 | 3.278 | 19.668 |
| 0.359999999999983 | 0.207 | 3.244 | 19.58 |
| 0.362999999999983 | 0.198 | 3.21 | 19.493 |
| 0.365999999999983 | 0.189 | 3.176 | 19.405 |
| 0.368999999999983 | 0.181 | 3.143 | 19.318 |
| 0.371999999999983 | 0.172 | 3.109 | 19.231 |
| 0.374999999999983 | 0.164 | 3.076 | 19.145 |
| 0.377999999999983 | 0.156 | 3.043 | 19.058 |
| 0.380999999999983 | 0.148 | 3.01 | 18.972 |
| 0.383999999999983 | 0.141 | 2.978 | 18.886 |
| 0.386999999999983 | 0.133 | 2.946 | 18.8 |
| 0.389999999999983 | 0.126 | 2.914 | 18.715 |
| 0.392999999999983 | 0.119 | 2.882 | 18.63 |
| 0.395999999999983 | 0.113 | 2.85 | 18.545 |
| 0.398999999999983 | 0.106 | 2.818 | 18.46 |
| 0.401999999999983 | 0.1 | 2.787 | 18.376 |
| 0.404999999999983 | 0.094 | 2.756 | 18.292 |
| 0.407999999999983 | 0.088 | 2.725 | 18.208 |
| 0.410999999999983 | 0.082 | 2.695 | 18.124 |
| 0.413999999999983 | 0.077 | 2.664 | 18.04 |
| 0.416999999999983 | 0.071 | 2.634 | 17.957 |
| 0.419999999999983 | 0.066 | 2.604 | 17.874 |
| 0.422999999999983 | 0.061 | 2.574 | 17.791 |
| 0.425999999999983 | 0.056 | 2.544 | 17.709 |
| 0.428999999999983 | 0.052 | 2.515 | 17.627 |
| 0.431999999999983 | 0.047 | 2.485 | 17.545 |
| 0.434999999999983 | 0.043 | 2.456 | 17.463 |
| 0.437999999999983 | 0.039 | 2.428 | 17.381 |
| 0.440999999999983 | 0.036 | 2.399 | 17.3 |
| 0.443999999999983 | 0.032 | 2.37 | 17.219 |
| 0.446999999999983 | 0.029 | 2.342 | 17.138 |
| 0.449999999999983 | 0.026 | 2.314 | 17.058 |
| 0.452999999999983 | 0.023 | 2.286 | 16.977 |
| 0.455999999999983 | 0.02 | 2.259 | 16.897 |
| 0.458999999999983 | 0.017 | 2.231 | 16.817 |
| 0.461999999999983 | 0.015 | 2.204 | 16.738 |
| 0.464999999999983 | 0.012 | 2.177 | 16.659 |
| 0.467999999999983 | 0.01 | 2.15 | 16.579 |
| 0.470999999999983 | 0.009 | 2.123 | 16.5 |
| 0.473999999999983 | 0.007 | 2.097 | 16.422 |
| 0.476999999999983 | 0.005 | 2.07 | 16.343 |
| 0.479999999999983 | 0.004 | 2.044 | 16.265 |
| 0.482999999999983 | 0.003 | 2.018 | 16.187 |
| 0.485999999999983 | 0.002 | 1.993 | 16.11 |
| 0.488999999999983 | 0.001 | 1.967 | 16.032 |
| 0.491999999999983 | 0.001 | 1.942 | 15.955 |
| 0.494999999999983 | 0 | 1.917 | 15.878 |
| 0.497999999999983 | 0 | 1.892 | 15.801 |
| 0.500999999999983 | 0 | 1.867 | 15.725 |
| 0.503999999999983 | 0 | 1.842 | 15.648 |
| 0.506999999999983 | 0 | 1.818 | 15.572 |
| 0.509999999999983 | 0.001 | 1.794 | 15.496 |
| 0.512999999999983 | 0.002 | 1.77 | 15.421 |
| 0.515999999999983 | 0.003 | 1.746 | 15.345 |
| 0.518999999999983 | 0.004 | 1.722 | 15.27 |
| 0.521999999999983 | 0.005 | 1.699 | 15.195 |
| 0.524999999999983 | 0.006 | 1.675 | 15.121 |
| 0.527999999999983 | 0.008 | 1.652 | 15.046 |
| 0.530999999999983 | 0.009 | 1.629 | 14.972 |
| 0.533999999999983 | 0.011 | 1.607 | 14.898 |
| 0.536999999999983 | 0.013 | 1.584 | 14.824 |
| 0.539999999999983 | 0.016 | 1.562 | 14.751 |
| 0.542999999999983 | 0.018 | 1.539 | 14.677 |
| 0.545999999999983 | 0.021 | 1.517 | 14.604 |
| 0.548999999999983 | 0.024 | 1.496 | 14.531 |
| 0.551999999999983 | 0.026 | 1.474 | 14.459 |
| 0.554999999999983 | 0.03 | 1.453 | 14.386 |
| 0.557999999999983 | 0.033 | 1.431 | 14.314 |
| 0.560999999999983 | 0.036 | 1.41 | 14.242 |
| 0.563999999999983 | 0.04 | 1.389 | 14.171 |
| 0.566999999999983 | 0.044 | 1.368 | 14.099 |
| 0.569999999999983 | 0.048 | 1.348 | 14.028 |
| 0.572999999999983 | 0.052 | 1.328 | 13.957 |
| 0.575999999999983 | 0.056 | 1.307 | 13.886 |
| 0.578999999999983 | 0.06 | 1.287 | 13.816 |
| 0.581999999999983 | 0.065 | 1.267 | 13.745 |
| 0.584999999999983 | 0.07 | 1.248 | 13.675 |
| 0.587999999999983 | 0.075 | 1.228 | 13.605 |
| 0.590999999999983 | 0.08 | 1.209 | 13.536 |
| 0.593999999999983 | 0.085 | 1.19 | 13.466 |
| 0.596999999999983 | 0.09 | 1.171 | 13.397 |
| 0.599999999999983 | 0.096 | 1.152 | 13.328 |
| 0.602999999999983 | 0.102 | 1.133 | 13.259 |
| 0.605999999999983 | 0.108 | 1.115 | 13.191 |
| 0.608999999999983 | 0.114 | 1.097 | 13.122 |
| 0.611999999999983 | 0.12 | 1.078 | 13.054 |
| 0.614999999999983 | 0.126 | 1.061 | 12.986 |
| 0.617999999999983 | 0.133 | 1.043 | 12.919 |
| 0.620999999999983 | 0.139 | 1.025 | 12.851 |
| 0.623999999999983 | 0.146 | 1.008 | 12.784 |
| 0.626999999999983 | 0.153 | 0.99 | 12.717 |
| 0.629999999999983 | 0.16 | 0.973 | 12.65 |
| 0.632999999999983 | 0.167 | 0.956 | 12.584 |
| 0.635999999999983 | 0.175 | 0.94 | 12.517 |
| 0.638999999999983 | 0.182 | 0.923 | 12.451 |
| 0.641999999999983 | 0.19 | 0.907 | 12.385 |
| 0.644999999999983 | 0.198 | 0.89 | 12.32 |
| 0.647999999999983 | 0.206 | 0.874 | 12.254 |
| 0.650999999999983 | 0.214 | 0.858 | 12.189 |
| 0.653999999999983 | 0.223 | 0.843 | 12.124 |
| 0.656999999999983 | 0.231 | 0.827 | 12.059 |
| 0.659999999999983 | 0.24 | 0.812 | 11.995 |
| 0.662999999999983 | 0.248 | 0.796 | 11.93 |
| 0.665999999999983 | 0.257 | 0.781 | 11.866 |
| 0.668999999999983 | 0.266 | 0.766 | 11.802 |
| 0.671999999999983 | 0.275 | 0.751 | 11.738 |
| 0.674999999999983 | 0.285 | 0.737 | 11.675 |
| 0.677999999999983 | 0.294 | 0.722 | 11.612 |
| 0.680999999999983 | 0.304 | 0.708 | 11.549 |
| 0.683999999999983 | 0.314 | 0.694 | 11.486 |
| 0.686999999999983 | 0.324 | 0.68 | 11.423 |
| 0.689999999999983 | 0.334 | 0.666 | 11.361 |
| 0.692999999999983 | 0.344 | 0.652 | 11.298 |
| 0.695999999999983 | 0.354 | 0.639 | 11.236 |
| 0.698999999999983 | 0.364 | 0.625 | 11.175 |
| 0.701999999999983 | 0.375 | 0.612 | 11.113 |
| 0.704999999999983 | 0.386 | 0.599 | 11.052 |
| 0.707999999999983 | 0.397 | 0.586 | 10.99 |
| 0.710999999999983 | 0.408 | 0.574 | 10.929 |
| 0.713999999999983 | 0.419 | 0.561 | 10.869 |
| 0.716999999999983 | 0.43 | 0.549 | 10.808 |
| 0.719999999999983 | 0.441 | 0.536 | 10.748 |
| 0.722999999999983 | 0.453 | 0.524 | 10.688 |
| 0.725999999999983 | 0.465 | 0.512 | 10.628 |
| 0.728999999999983 | 0.476 | 0.5 | 10.568 |
| 0.731999999999983 | 0.488 | 0.489 | 10.509 |
| 0.734999999999983 | 0.5 | 0.477 | 10.449 |
| 0.737999999999983 | 0.513 | 0.466 | 10.39 |
| 0.740999999999983 | 0.525 | 0.455 | 10.332 |
| 0.743999999999983 | 0.537 | 0.444 | 10.273 |
| 0.746999999999983 | 0.55 | 0.433 | 10.214 |
| 0.749999999999983 | 0.562 | 0.422 | 10.156 |
| 0.752999999999983 | 0.575 | 0.411 | 10.098 |
| 0.755999999999983 | 0.588 | 0.401 | 10.04 |
| 0.758999999999983 | 0.601 | 0.39 | 9.983 |
| 0.761999999999983 | 0.615 | 0.38 | 9.925 |
| 0.764999999999983 | 0.628 | 0.37 | 9.868 |
| 0.767999999999983 | 0.641 | 0.36 | 9.811 |
| 0.770999999999983 | 0.655 | 0.351 | 9.754 |
| 0.773999999999983 | 0.668 | 0.341 | 9.698 |
| 0.776999999999983 | 0.682 | 0.332 | 9.641 |
| 0.779999999999983 | 0.696 | 0.322 | 9.585 |
| 0.782999999999983 | 0.71 | 0.313 | 9.529 |
| 0.785999999999983 | 0.724 | 0.304 | 9.474 |
| 0.788999999999983 | 0.739 | 0.295 | 9.418 |
| 0.791999999999983 | 0.753 | 0.287 | 9.363 |
| 0.794999999999983 | 0.768 | 0.278 | 9.307 |
| 0.797999999999983 | 0.782 | 0.27 | 9.253 |
| 0.800999999999983 | 0.797 | 0.261 | 9.198 |
| 0.803999999999983 | 0.812 | 0.253 | 9.143 |
| 0.806999999999983 | 0.827 | 0.245 | 9.089 |
| 0.809999999999983 | 0.842 | 0.237 | 9.035 |
| 0.812999999999983 | 0.857 | 0.229 | 8.981 |
| 0.815999999999983 | 0.872 | 0.222 | 8.927 |
| 0.818999999999983 | 0.888 | 0.214 | 8.873 |
| 0.821999999999983 | 0.903 | 0.207 | 8.82 |
| 0.824999999999983 | 0.919 | 0.2 | 8.767 |
| 0.827999999999983 | 0.935 | 0.193 | 8.714 |
| 0.830999999999983 | 0.951 | 0.186 | 8.661 |
| 0.833999999999983 | 0.967 | 0.179 | 8.609 |
| 0.836999999999983 | 0.983 | 0.172 | 8.556 |
| 0.839999999999983 | 0.999 | 0.166 | 8.504 |
| 0.842999999999983 | 1.015 | 0.16 | 8.452 |
| 0.845999999999983 | 1.031 | 0.153 | 8.4 |
| 0.848999999999983 | 1.048 | 0.147 | 8.349 |
| 0.851999999999983 | 1.065 | 0.141 | 8.298 |
| 0.854999999999983 | 1.081 | 0.135 | 8.246 |
| 0.857999999999983 | 1.098 | 0.13 | 8.195 |
| 0.860999999999983 | 1.115 | 0.124 | 8.145 |
| 0.863999999999984 | 1.132 | 0.119 | 8.094 |
| 0.866999999999984 | 1.149 | 0.113 | 8.044 |
| 0.869999999999984 | 1.166 | 0.108 | 7.993 |
| 0.872999999999984 | 1.184 | 0.103 | 7.943 |
| 0.875999999999984 | 1.201 | 0.098 | 7.894 |
| 0.878999999999984 | 1.219 | 0.093 | 7.844 |
| 0.881999999999984 | 1.236 | 0.088 | 7.795 |
| 0.884999999999984 | 1.254 | 0.084 | 7.745 |
| 0.887999999999984 | 1.272 | 0.079 | 7.696 |
| 0.890999999999984 | 1.29 | 0.075 | 7.647 |
| 0.893999999999984 | 1.308 | 0.071 | 7.599 |
| 0.896999999999984 | 1.326 | 0.067 | 7.55 |
| 0.899999999999984 | 1.344 | 0.063 | 7.502 |
| 0.902999999999984 | 1.362 | 0.059 | 7.454 |
| 0.905999999999984 | 1.381 | 0.056 | 7.406 |
| 0.908999999999984 | 1.399 | 0.052 | 7.358 |
| 0.911999999999984 | 1.418 | 0.049 | 7.311 |
| 0.914999999999984 | 1.436 | 0.045 | 7.263 |
| 0.917999999999984 | 1.455 | 0.042 | 7.216 |
| 0.920999999999984 | 1.474 | 0.039 | 7.169 |
| 0.923999999999984 | 1.493 | 0.036 | 7.123 |
| 0.926999999999984 | 1.512 | 0.033 | 7.076 |
| 0.929999999999984 | 1.531 | 0.03 | 7.03 |
| 0.932999999999984 | 1.55 | 0.028 | 6.983 |
| 0.935999999999984 | 1.569 | 0.025 | 6.937 |
| 0.938999999999984 | 1.589 | 0.023 | 6.892 |
| 0.941999999999984 | 1.608 | 0.021 | 6.846 |
| 0.944999999999984 | 1.628 | 0.019 | 6.801 |
| 0.947999999999984 | 1.647 | 0.017 | 6.755 |
| 0.950999999999984 | 1.667 | 0.015 | 6.71 |
| 0.953999999999984 | 1.687 | 0.013 | 6.665 |
| 0.956999999999984 | 1.707 | 0.011 | 6.621 |
| 0.959999999999984 | 1.727 | 0.01 | 6.576 |
| 0.962999999999984 | 1.747 | 0.008 | 6.532 |
| 0.965999999999984 | 1.767 | 0.007 | 6.488 |
| 0.968999999999984 | 1.787 | 0.006 | 6.444 |
| 0.971999999999984 | 1.807 | 0.005 | 6.4 |
| 0.974999999999984 | 1.828 | 0.004 | 6.356 |
| 0.977999999999984 | 1.848 | 0.003 | 6.313 |
| 0.980999999999984 | 1.868 | 0.002 | 6.27 |
| 0.983999999999984 | 1.889 | 0.002 | 6.227 |
| 0.986999999999984 | 1.91 | 0.001 | 6.184 |
| 0.989999999999984 | 1.93 | 0.001 | 6.141 |
| 0.992999999999984 | 1.951 | 0 | 6.098 |
| 0.995999999999984 | 1.972 | 0 | 6.056 |
| 0.998999999999984 | 1.993 | 0 | 6.014 |
| 1.001999999999984 | 2.014 | 0 | 5.972 |
| 1.004999999999983 | 2.035 | 0 | 5.93 |
| 1.007999999999983 | 2.056 | 0 | 5.889 |
| 1.010999999999983 | 2.077 | 0.001 | 5.847 |
| 1.013999999999983 | 2.099 | 0.001 | 5.806 |
| 1.016999999999983 | 2.12 | 0.002 | 5.765 |
| 1.019999999999983 | 2.142 | 0.002 | 5.724 |
| 1.022999999999983 | 2.163 | 0.003 | 5.683 |
| 1.025999999999983 | 2.185 | 0.004 | 5.643 |
| 1.028999999999983 | 2.206 | 0.005 | 5.602 |
| 1.031999999999982 | 2.228 | 0.006 | 5.562 |
| 1.034999999999982 | 2.25 | 0.007 | 5.522 |
| 1.037999999999982 | 2.272 | 0.008 | 5.482 |
| 1.040999999999982 | 2.293 | 0.01 | 5.443 |
| 1.043999999999982 | 2.315 | 0.011 | 5.403 |
| 1.046999999999982 | 2.337 | 0.013 | 5.364 |
| 1.049999999999982 | 2.359 | 0.015 | 5.325 |
| 1.052999999999982 | 2.382 | 0.016 | 5.286 |
| 1.055999999999982 | 2.404 | 0.018 | 5.247 |
| 1.058999999999981 | 2.426 | 0.02 | 5.208 |
| 1.061999999999981 | 2.448 | 0.022 | 5.17 |
| 1.064999999999981 | 2.471 | 0.025 | 5.132 |
| 1.067999999999981 | 2.493 | 0.027 | 5.094 |
| 1.070999999999981 | 2.516 | 0.029 | 5.056 |
| 1.073999999999981 | 2.538 | 0.032 | 5.018 |
| 1.076999999999981 | 2.561 | 0.034 | 4.98 |
| 1.079999999999981 | 2.584 | 0.037 | 4.943 |
| 1.082999999999981 | 2.606 | 0.04 | 4.906 |
| 1.085999999999981 | 2.629 | 0.042 | 4.869 |
| 1.08899999999998 | 2.652 | 0.045 | 4.832 |
| 1.09199999999998 | 2.675 | 0.048 | 4.795 |
| 1.09499999999998 | 2.698 | 0.052 | 4.759 |
| 1.09799999999998 | 2.721 | 0.055 | 4.722 |
| 1.10099999999998 | 2.744 | 0.058 | 4.686 |
| 1.10399999999998 | 2.767 | 0.062 | 4.65 |
| 1.10699999999998 | 2.79 | 0.065 | 4.614 |
| 1.10999999999998 | 2.813 | 0.069 | 4.578 |
| 1.11299999999998 | 2.836 | 0.072 | 4.543 |
| 1.115999999999979 | 2.86 | 0.076 | 4.507 |
| 1.118999999999979 | 2.883 | 0.08 | 4.472 |
| 1.121999999999979 | 2.906 | 0.084 | 4.437 |
| 1.124999999999979 | 2.93 | 0.088 | 4.402 |
| 1.127999999999979 | 2.953 | 0.092 | 4.368 |
| 1.130999999999979 | 2.977 | 0.096 | 4.333 |
| 1.133999999999979 | 3 | 0.101 | 4.299 |
| 1.136999999999979 | 3.024 | 0.105 | 4.265 |
| 1.139999999999979 | 3.047 | 0.109 | 4.231 |
| 1.142999999999978 | 3.071 | 0.114 | 4.197 |
| 1.145999999999978 | 3.095 | 0.119 | 4.163 |
| 1.148999999999978 | 3.119 | 0.123 | 4.129 |
| 1.151999999999978 | 3.142 | 0.128 | 4.096 |
| 1.154999999999978 | 3.166 | 0.133 | 4.063 |
| 1.157999999999978 | 3.19 | 0.138 | 4.03 |
| 1.160999999999978 | 3.214 | 0.143 | 3.997 |
| 1.163999999999978 | 3.238 | 0.148 | 3.964 |
| 1.166999999999978 | 3.262 | 0.153 | 3.932 |
| 1.169999999999977 | 3.286 | 0.159 | 3.899 |
| 1.172999999999977 | 3.31 | 0.164 | 3.867 |
| 1.175999999999977 | 3.334 | 0.17 | 3.835 |
| 1.178999999999977 | 3.358 | 0.175 | 3.803 |
| 1.181999999999977 | 3.382 | 0.181 | 3.771 |
| 1.184999999999977 | 3.407 | 0.186 | 3.74 |
| 1.187999999999977 | 3.431 | 0.192 | 3.708 |
| 1.190999999999977 | 3.455 | 0.198 | 3.677 |
| 1.193999999999977 | 3.479 | 0.204 | 3.646 |
| 1.196999999999976 | 3.504 | 0.21 | 3.615 |
| 1.199999999999976 | 3.528 | 0.216 | 3.584 |
| 1.202999999999976 | 3.552 | 0.222 | 3.553 |
| 1.205999999999976 | 3.577 | 0.228 | 3.523 |
| 1.208999999999976 | 3.601 | 0.235 | 3.493 |
| 1.211999999999976 | 3.626 | 0.241 | 3.462 |
| 1.214999999999976 | 3.65 | 0.248 | 3.432 |
| 1.217999999999976 | 3.675 | 0.254 | 3.403 |
| 1.220999999999976 | 3.699 | 0.261 | 3.373 |
| 1.223999999999976 | 3.724 | 0.267 | 3.343 |
| 1.226999999999975 | 3.748 | 0.274 | 3.314 |
| 1.229999999999975 | 3.773 | 0.281 | 3.285 |
| 1.232999999999975 | 3.798 | 0.288 | 3.256 |
| 1.235999999999975 | 3.822 | 0.295 | 3.227 |
| 1.238999999999975 | 3.847 | 0.302 | 3.198 |
| 1.241999999999975 | 3.872 | 0.309 | 3.169 |
| 1.244999999999975 | 3.896 | 0.316 | 3.141 |
| 1.247999999999975 | 3.921 | 0.323 | 3.113 |
| 1.250999999999975 | 3.946 | 0.331 | 3.084 |
| 1.253999999999974 | 3.971 | 0.338 | 3.056 |
| 1.256999999999974 | 3.995 | 0.345 | 3.029 |
| 1.259999999999974 | 4.02 | 0.353 | 3.001 |
| 1.262999999999974 | 4.045 | 0.36 | 2.973 |
| 1.265999999999974 | 4.07 | 0.368 | 2.946 |
| 1.268999999999974 | 4.095 | 0.376 | 2.919 |
| 1.271999999999974 | 4.119 | 0.384 | 2.892 |
| 1.274999999999974 | 4.144 | 0.391 | 2.865 |
| 1.277999999999974 | 4.169 | 0.399 | 2.838 |
| 1.280999999999973 | 4.194 | 0.407 | 2.811 |
| 1.283999999999973 | 4.219 | 0.415 | 2.785 |
| 1.286999999999973 | 4.244 | 0.423 | 2.758 |
| 1.289999999999973 | 4.269 | 0.431 | 2.732 |
| 1.292999999999973 | 4.294 | 0.44 | 2.706 |
| 1.295999999999973 | 4.319 | 0.448 | 2.68 |
| 1.298999999999973 | 4.344 | 0.456 | 2.655 |
| 1.301999999999973 | 4.369 | 0.465 | 2.629 |
| 1.304999999999973 | 4.394 | 0.473 | 2.604 |
| 1.307999999999972 | 4.419 | 0.482 | 2.578 |
| 1.310999999999972 | 4.444 | 0.49 | 2.553 |
| 1.313999999999972 | 4.469 | 0.499 | 2.528 |
| 1.316999999999972 | 4.494 | 0.507 | 2.503 |
| 1.319999999999972 | 4.519 | 0.516 | 2.478 |
| 1.322999999999972 | 4.544 | 0.525 | 2.454 |
| 1.325999999999972 | 4.569 | 0.534 | 2.429 |
| 1.328999999999972 | 4.594 | 0.543 | 2.405 |
| 1.331999999999972 | 4.619 | 0.552 | 2.381 |
| 1.334999999999971 | 4.644 | 0.561 | 2.357 |
| 1.337999999999971 | 4.669 | 0.57 | 2.333 |
| 1.340999999999971 | 4.694 | 0.579 | 2.31 |
| 1.343999999999971 | 4.719 | 0.588 | 2.286 |
| 1.346999999999971 | 4.744 | 0.597 | 2.263 |
| 1.349999999999971 | 4.768 | 0.606 | 2.239 |
| 1.352999999999971 | 4.793 | 0.616 | 2.216 |
| 1.355999999999971 | 4.818 | 0.625 | 2.193 |
| 1.358999999999971 | 4.843 | 0.634 | 2.17 |
| 1.361999999999971 | 4.868 | 0.644 | 2.148 |
| 1.36499999999997 | 4.893 | 0.653 | 2.125 |
| 1.36799999999997 | 4.918 | 0.663 | 2.103 |
| 1.37099999999997 | 4.943 | 0.673 | 2.08 |
| 1.37399999999997 | 4.968 | 0.682 | 2.058 |
| 1.37699999999997 | 4.993 | 0.692 | 2.036 |
| 1.37999999999997 | 5.018 | 0.702 | 2.014 |
| 1.38299999999997 | 5.043 | 0.712 | 1.993 |
| 1.38599999999997 | 5.068 | 0.721 | 1.971 |
| 1.38899999999997 | 5.093 | 0.731 | 1.949 |
| 1.391999999999969 | 5.118 | 0.741 | 1.928 |
| 1.394999999999969 | 5.143 | 0.751 | 1.907 |
| 1.397999999999969 | 5.167 | 0.761 | 1.886 |
| 1.400999999999969 | 5.192 | 0.771 | 1.865 |
| 1.403999999999969 | 5.217 | 0.781 | 1.844 |
| 1.406999999999969 | 5.242 | 0.792 | 1.824 |
| 1.409999999999969 | 5.267 | 0.802 | 1.803 |
| 1.412999999999969 | 5.291 | 0.812 | 1.783 |
| 1.415999999999969 | 5.316 | 0.822 | 1.763 |
| 1.418999999999968 | 5.341 | 0.833 | 1.742 |
| 1.421999999999968 | 5.366 | 0.843 | 1.723 |
| 1.424999999999968 | 5.39 | 0.853 | 1.703 |
| 1.427999999999968 | 5.415 | 0.864 | 1.683 |
| 1.430999999999968 | 5.44 | 0.874 | 1.663 |
| 1.433999999999968 | 5.464 | 0.885 | 1.644 |
| 1.436999999999968 | 5.489 | 0.895 | 1.625 |
| 1.439999999999968 | 5.514 | 0.906 | 1.606 |
| 1.442999999999968 | 5.538 | 0.917 | 1.587 |
| 1.445999999999968 | 5.563 | 0.927 | 1.568 |
| 1.448999999999967 | 5.587 | 0.938 | 1.549 |
| 1.451999999999967 | 5.612 | 0.949 | 1.53 |
| 1.454999999999967 | 5.636 | 0.96 | 1.512 |
| 1.457999999999967 | 5.661 | 0.97 | 1.493 |
| 1.460999999999967 | 5.685 | 0.981 | 1.475 |
| 1.463999999999967 | 5.71 | 0.992 | 1.457 |
| 1.466999999999967 | 5.734 | 1.003 | 1.439 |
| 1.469999999999967 | 5.758 | 1.014 | 1.421 |
| 1.472999999999967 | 5.783 | 1.025 | 1.404 |
| 1.475999999999966 | 5.807 | 1.036 | 1.386 |
| 1.478999999999966 | 5.831 | 1.047 | 1.369 |
| 1.481999999999966 | 5.855 | 1.058 | 1.351 |
| 1.484999999999966 | 5.88 | 1.069 | 1.334 |
| 1.487999999999966 | 5.904 | 1.08 | 1.317 |
| 1.490999999999966 | 5.928 | 1.091 | 1.3 |
| 1.493999999999966 | 5.952 | 1.103 | 1.283 |
| 1.496999999999966 | 5.976 | 1.114 | 1.267 |
| 1.499999999999966 | 6 | 1.125 | 1.25 |
| 1.502999999999965 | 6.024 | 1.136 | 1.234 |
| 1.505999999999965 | 6.048 | 1.148 | 1.217 |
| 1.508999999999965 | 6.072 | 1.159 | 1.201 |
| 1.511999999999965 | 6.096 | 1.17 | 1.185 |
| 1.514999999999965 | 6.12 | 1.182 | 1.169 |
| 1.517999999999965 | 6.143 | 1.193 | 1.153 |
| 1.520999999999965 | 6.167 | 1.204 | 1.138 |
| 1.523999999999965 | 6.191 | 1.216 | 1.122 |
| 1.526999999999965 | 6.214 | 1.227 | 1.107 |
| 1.529999999999964 | 6.238 | 1.239 | 1.091 |
| 1.532999999999964 | 6.262 | 1.25 | 1.076 |
| 1.535999999999964 | 6.285 | 1.262 | 1.061 |
| 1.538999999999964 | 6.309 | 1.273 | 1.046 |
| 1.541999999999964 | 6.332 | 1.285 | 1.031 |
| 1.544999999999964 | 6.356 | 1.297 | 1.016 |
| 1.547999999999964 | 6.379 | 1.308 | 1.002 |
| 1.550999999999964 | 6.402 | 1.32 | 0.987 |
| 1.553999999999964 | 6.426 | 1.331 | 0.973 |
| 1.556999999999964 | 6.449 | 1.343 | 0.959 |
| 1.559999999999963 | 6.472 | 1.355 | 0.945 |
| 1.562999999999963 | 6.495 | 1.366 | 0.931 |
| 1.565999999999963 | 6.518 | 1.378 | 0.917 |
| 1.568999999999963 | 6.541 | 1.39 | 0.903 |
| 1.571999999999963 | 6.564 | 1.402 | 0.89 |
| 1.574999999999963 | 6.587 | 1.413 | 0.876 |
| 1.577999999999963 | 6.61 | 1.425 | 0.863 |
| 1.580999999999963 | 6.633 | 1.437 | 0.849 |
| 1.583999999999963 | 6.656 | 1.449 | 0.836 |
| 1.586999999999962 | 6.678 | 1.461 | 0.823 |
| 1.589999999999962 | 6.701 | 1.472 | 0.81 |
| 1.592999999999962 | 6.723 | 1.484 | 0.797 |
| 1.595999999999962 | 6.746 | 1.496 | 0.785 |
| 1.598999999999962 | 6.769 | 1.508 | 0.772 |
| 1.601999999999962 | 6.791 | 1.52 | 0.76 |
| 1.604999999999962 | 6.813 | 1.532 | 0.747 |
| 1.607999999999962 | 6.836 | 1.544 | 0.735 |
| 1.610999999999961 | 6.858 | 1.556 | 0.723 |
| 1.613999999999961 | 6.88 | 1.568 | 0.711 |
| 1.616999999999961 | 6.902 | 1.579 | 0.699 |
| 1.619999999999961 | 6.924 | 1.591 | 0.687 |
| 1.622999999999961 | 6.946 | 1.603 | 0.676 |
| 1.625999999999961 | 6.968 | 1.615 | 0.664 |
| 1.628999999999961 | 6.99 | 1.627 | 0.653 |
| 1.631999999999961 | 7.012 | 1.639 | 0.641 |
| 1.634999999999961 | 7.034 | 1.651 | 0.63 |
| 1.637999999999961 | 7.055 | 1.663 | 0.619 |
| 1.64099999999996 | 7.077 | 1.675 | 0.608 |
| 1.64399999999996 | 7.099 | 1.687 | 0.597 |
| 1.64699999999996 | 7.12 | 1.699 | 0.586 |
| 1.64999999999996 | 7.141 | 1.711 | 0.576 |
| 1.65299999999996 | 7.163 | 1.723 | 0.565 |
| 1.65599999999996 | 7.184 | 1.735 | 0.555 |
| 1.65899999999996 | 7.205 | 1.747 | 0.544 |
| 1.66199999999996 | 7.227 | 1.759 | 0.534 |
| 1.66499999999996 | 7.248 | 1.771 | 0.524 |
| 1.667999999999959 | 7.269 | 1.783 | 0.514 |
| 1.670999999999959 | 7.29 | 1.795 | 0.504 |
| 1.673999999999959 | 7.31 | 1.807 | 0.494 |
| 1.676999999999959 | 7.331 | 1.819 | 0.485 |
| 1.679999999999959 | 7.352 | 1.831 | 0.475 |
| 1.682999999999959 | 7.373 | 1.843 | 0.466 |
| 1.685999999999959 | 7.393 | 1.855 | 0.456 |
| 1.688999999999959 | 7.414 | 1.867 | 0.447 |
| 1.691999999999959 | 7.434 | 1.879 | 0.438 |
| 1.694999999999958 | 7.454 | 1.891 | 0.429 |
| 1.697999999999958 | 7.475 | 1.903 | 0.42 |
| 1.700999999999958 | 7.495 | 1.915 | 0.411 |
| 1.703999999999958 | 7.515 | 1.927 | 0.402 |
| 1.706999999999958 | 7.535 | 1.939 | 0.394 |
| 1.709999999999958 | 7.555 | 1.951 | 0.385 |
| 1.712999999999958 | 7.575 | 1.963 | 0.377 |
| 1.715999999999958 | 7.594 | 1.975 | 0.368 |
| 1.718999999999958 | 7.614 | 1.987 | 0.36 |
| 1.721999999999957 | 7.634 | 1.999 | 0.352 |
| 1.724999999999957 | 7.653 | 2.011 | 0.344 |
| 1.727999999999957 | 7.673 | 2.022 | 0.336 |
| 1.730999999999957 | 7.692 | 2.034 | 0.328 |
| 1.733999999999957 | 7.711 | 2.046 | 0.321 |
| 1.736999999999957 | 7.73 | 2.058 | 0.313 |
| 1.739999999999957 | 7.75 | 2.07 | 0.306 |
| 1.742999999999957 | 7.769 | 2.082 | 0.298 |
| 1.745999999999957 | 7.787 | 2.094 | 0.291 |
| 1.748999999999957 | 7.806 | 2.105 | 0.284 |
| 1.751999999999956 | 7.825 | 2.117 | 0.277 |
| 1.754999999999956 | 7.844 | 2.129 | 0.27 |
| 1.757999999999956 | 7.862 | 2.141 | 0.263 |
| 1.760999999999956 | 7.881 | 2.153 | 0.256 |
| 1.763999999999956 | 7.899 | 2.164 | 0.249 |
| 1.766999999999956 | 7.917 | 2.176 | 0.242 |
| 1.769999999999956 | 7.935 | 2.188 | 0.236 |
| 1.772999999999956 | 7.954 | 2.2 | 0.23 |
| 1.775999999999956 | 7.972 | 2.211 | 0.223 |
| 1.778999999999955 | 7.989 | 2.223 | 0.217 |
| 1.781999999999955 | 8.007 | 2.235 | 0.211 |
| 1.784999999999955 | 8.025 | 2.246 | 0.205 |
| 1.787999999999955 | 8.043 | 2.258 | 0.199 |
| 1.790999999999955 | 8.06 | 2.269 | 0.193 |
| 1.793999999999955 | 8.077 | 2.281 | 0.187 |
| 1.796999999999955 | 8.095 | 2.292 | 0.182 |
| 1.799999999999955 | 8.112 | 2.304 | 0.176 |
| 1.802999999999955 | 8.129 | 2.316 | 0.171 |
| 1.805999999999954 | 8.146 | 2.327 | 0.165 |
| 1.808999999999954 | 8.163 | 2.338 | 0.16 |
| 1.811999999999954 | 8.18 | 2.35 | 0.155 |
| 1.814999999999954 | 8.197 | 2.361 | 0.15 |
| 1.817999999999954 | 8.213 | 2.373 | 0.145 |
| 1.820999999999954 | 8.23 | 2.384 | 0.14 |
| 1.823999999999954 | 8.246 | 2.395 | 0.135 |
| 1.826999999999954 | 8.262 | 2.407 | 0.13 |
| 1.829999999999954 | 8.278 | 2.418 | 0.125 |
| 1.832999999999954 | 8.295 | 2.429 | 0.121 |
| 1.835999999999953 | 8.31 | 2.441 | 0.116 |
| 1.838999999999953 | 8.326 | 2.452 | 0.112 |
| 1.841999999999953 | 8.342 | 2.463 | 0.108 |
| 1.844999999999953 | 8.358 | 2.474 | 0.104 |
| 1.847999999999953 | 8.373 | 2.485 | 0.099 |
| 1.850999999999953 | 8.389 | 2.496 | 0.095 |
| 1.853999999999953 | 8.404 | 2.507 | 0.091 |
| 1.856999999999953 | 8.419 | 2.518 | 0.088 |
| 1.859999999999953 | 8.434 | 2.529 | 0.084 |
| 1.862999999999952 | 8.449 | 2.54 | 0.08 |
| 1.865999999999952 | 8.464 | 2.551 | 0.077 |
| 1.868999999999952 | 8.479 | 2.562 | 0.073 |
| 1.871999999999952 | 8.493 | 2.573 | 0.07 |
| 1.874999999999952 | 8.508 | 2.584 | 0.066 |
| 1.877999999999952 | 8.522 | 2.595 | 0.063 |
| 1.880999999999952 | 8.536 | 2.606 | 0.06 |
| 1.883999999999952 | 8.551 | 2.616 | 0.057 |
| 1.886999999999952 | 8.565 | 2.627 | 0.054 |
| 1.889999999999951 | 8.579 | 2.638 | 0.051 |
| 1.892999999999951 | 8.592 | 2.648 | 0.048 |
| 1.895999999999951 | 8.606 | 2.659 | 0.046 |
| 1.898999999999951 | 8.62 | 2.669 | 0.043 |
| 1.901999999999951 | 8.633 | 2.68 | 0.04 |
| 1.904999999999951 | 8.646 | 2.69 | 0.038 |
| 1.907999999999951 | 8.659 | 2.701 | 0.035 |
| 1.910999999999951 | 8.672 | 2.711 | 0.033 |
| 1.913999999999951 | 8.685 | 2.722 | 0.031 |
| 1.91699999999995 | 8.698 | 2.732 | 0.029 |
| 1.91999999999995 | 8.711 | 2.742 | 0.027 |
| 1.92299999999995 | 8.723 | 2.753 | 0.025 |
| 1.92599999999995 | 8.736 | 2.763 | 0.023 |
| 1.92899999999995 | 8.748 | 2.773 | 0.021 |
| 1.93199999999995 | 8.76 | 2.783 | 0.019 |
| 1.93499999999995 | 8.772 | 2.793 | 0.017 |
| 1.93799999999995 | 8.784 | 2.803 | 0.016 |
| 1.94099999999995 | 8.796 | 2.813 | 0.014 |
| 1.94399999999995 | 8.808 | 2.823 | 0.013 |
| 1.946999999999949 | 8.819 | 2.833 | 0.012 |
| 1.949999999999949 | 8.83 | 2.843 | 0.01 |
| 1.952999999999949 | 8.842 | 2.853 | 0.009 |
| 1.955999999999949 | 8.853 | 2.862 | 0.008 |
| 1.958999999999949 | 8.864 | 2.872 | 0.007 |
| 1.961999999999949 | 8.875 | 2.882 | 0.006 |
| 1.964999999999949 | 8.885 | 2.891 | 0.005 |
| 1.967999999999949 | 8.896 | 2.901 | 0.004 |
| 1.970999999999949 | 8.906 | 2.911 | 0.003 |
| 1.973999999999948 | 8.917 | 2.92 | 0.003 |
| 1.976999999999948 | 8.927 | 2.929 | 0.002 |
| 1.979999999999948 | 8.937 | 2.939 | 0.002 |
| 1.982999999999948 | 8.947 | 2.948 | 0.001 |
| 1.985999999999948 | 8.956 | 2.957 | 0.001 |
| 1.988999999999948 | 8.966 | 2.967 | 0 |
| 1.991999999999948 | 8.975 | 2.976 | 0 |
| 1.994999999999948 | 8.985 | 2.985 | 0 |
| 1.997999999999948 | 8.994 | 2.994 | 0 |
| 2.000999999999947 | 9.003 | 3.003 | 0 |
| 2.003999999999948 | 9.012 | 3.012 | 0 |
| 2.006999999999948 | 9.021 | 3.021 | 0 |
| 2.009999999999948 | 9.029 | 3.03 | 0 |
| 2.012999999999948 | 9.038 | 3.038 | 0.001 |
| 2.015999999999948 | 9.046 | 3.047 | 0.001 |
| 2.018999999999948 | 9.054 | 3.056 | 0.001 |
| 2.021999999999948 | 9.062 | 3.065 | 0.002 |
| 2.024999999999948 | 9.07 | 3.073 | 0.002 |
| 2.027999999999949 | 9.078 | 3.082 | 0.003 |
| 2.030999999999949 | 9.085 | 3.09 | 0.004 |
| 2.033999999999949 | 9.093 | 3.098 | 0.005 |
| 2.036999999999949 | 9.1 | 3.107 | 0.005 |
| 2.039999999999949 | 9.107 | 3.115 | 0.006 |
| 2.042999999999949 | 9.114 | 3.123 | 0.007 |
| 2.045999999999949 | 9.121 | 3.131 | 0.008 |
| 2.048999999999949 | 9.127 | 3.139 | 0.009 |
| 2.051999999999949 | 9.134 | 3.147 | 0.011 |
| 2.05499999999995 | 9.14 | 3.155 | 0.012 |
| 2.05799999999995 | 9.146 | 3.163 | 0.013 |
| 2.06099999999995 | 9.152 | 3.171 | 0.014 |
| 2.06399999999995 | 9.158 | 3.179 | 0.016 |
| 2.06699999999995 | 9.164 | 3.187 | 0.017 |
| 2.06999999999995 | 9.169 | 3.194 | 0.019 |
| 2.07299999999995 | 9.175 | 3.202 | 0.021 |
| 2.07599999999995 | 9.18 | 3.209 | 0.022 |
| 2.07899999999995 | 9.185 | 3.217 | 0.024 |
| 2.081999999999951 | 9.19 | 3.224 | 0.026 |
| 2.084999999999951 | 9.195 | 3.231 | 0.028 |
| 2.087999999999951 | 9.199 | 3.239 | 0.03 |
| 2.090999999999951 | 9.204 | 3.246 | 0.032 |
| 2.093999999999951 | 9.208 | 3.253 | 0.034 |
| 2.096999999999951 | 9.212 | 3.26 | 0.036 |
| 2.099999999999951 | 9.216 | 3.267 | 0.038 |
| 2.102999999999951 | 9.22 | 3.274 | 0.04 |
| 2.105999999999951 | 9.223 | 3.281 | 0.043 |
| 2.108999999999952 | 9.227 | 3.287 | 0.045 |
| 2.111999999999952 | 9.23 | 3.294 | 0.047 |
| 2.114999999999952 | 9.233 | 3.301 | 0.05 |
| 2.117999999999952 | 9.236 | 3.307 | 0.052 |
| 2.120999999999952 | 9.239 | 3.314 | 0.055 |
| 2.123999999999952 | 9.241 | 3.32 | 0.058 |
| 2.126999999999952 | 9.244 | 3.326 | 0.06 |
| 2.129999999999952 | 9.246 | 3.333 | 0.063 |
| 2.132999999999952 | 9.248 | 3.339 | 0.066 |
| 2.135999999999953 | 9.25 | 3.345 | 0.069 |
| 2.138999999999953 | 9.252 | 3.351 | 0.072 |
| 2.141999999999953 | 9.253 | 3.357 | 0.075 |
| 2.144999999999953 | 9.255 | 3.363 | 0.078 |
| 2.147999999999953 | 9.256 | 3.369 | 0.081 |
| 2.150999999999953 | 9.257 | 3.374 | 0.084 |
| 2.153999999999953 | 9.258 | 3.38 | 0.088 |
| 2.156999999999953 | 9.258 | 3.385 | 0.091 |
| 2.159999999999953 | 9.259 | 3.391 | 0.094 |
| 2.162999999999954 | 9.259 | 3.396 | 0.098 |
| 2.165999999999954 | 9.259 | 3.402 | 0.101 |
| 2.168999999999954 | 9.259 | 3.407 | 0.105 |
| 2.171999999999954 | 9.259 | 3.412 | 0.108 |
| 2.174999999999954 | 9.259 | 3.417 | 0.112 |
| 2.177999999999954 | 9.258 | 3.422 | 0.115 |
| 2.180999999999954 | 9.257 | 3.427 | 0.119 |
| 2.183999999999954 | 9.256 | 3.432 | 0.123 |
| 2.186999999999955 | 9.255 | 3.436 | 0.127 |
| 2.189999999999955 | 9.254 | 3.441 | 0.131 |
| 2.192999999999955 | 9.252 | 3.446 | 0.135 |
| 2.195999999999955 | 9.251 | 3.45 | 0.139 |
| 2.198999999999955 | 9.249 | 3.455 | 0.143 |
| 2.201999999999955 | 9.247 | 3.459 | 0.147 |
| 2.204999999999955 | 9.244 | 3.463 | 0.151 |
| 2.207999999999955 | 9.242 | 3.467 | 0.155 |
| 2.210999999999955 | 9.239 | 3.471 | 0.159 |
| 2.213999999999956 | 9.236 | 3.475 | 0.164 |
| 2.216999999999956 | 9.233 | 3.479 | 0.168 |
| 2.219999999999956 | 9.23 | 3.483 | 0.172 |
| 2.222999999999956 | 9.227 | 3.487 | 0.177 |
| 2.225999999999956 | 9.223 | 3.49 | 0.181 |
| 2.228999999999956 | 9.219 | 3.494 | 0.186 |
| 2.231999999999956 | 9.215 | 3.497 | 0.19 |
| 2.234999999999956 | 9.211 | 3.5 | 0.195 |
| 2.237999999999956 | 9.207 | 3.504 | 0.2 |
| 2.240999999999956 | 9.202 | 3.507 | 0.204 |
| 2.243999999999956 | 9.198 | 3.51 | 0.209 |
| 2.246999999999957 | 9.193 | 3.513 | 0.214 |
| 2.249999999999957 | 9.188 | 3.516 | 0.219 |
| 2.252999999999957 | 9.182 | 3.518 | 0.224 |
| 2.255999999999957 | 9.177 | 3.521 | 0.229 |
| 2.258999999999957 | 9.171 | 3.524 | 0.234 |
| 2.261999999999957 | 9.165 | 3.526 | 0.239 |
| 2.264999999999957 | 9.159 | 3.528 | 0.244 |
| 2.267999999999957 | 9.152 | 3.531 | 0.249 |
| 2.270999999999958 | 9.146 | 3.533 | 0.254 |
| 2.273999999999958 | 9.139 | 3.535 | 0.259 |
| 2.276999999999958 | 9.132 | 3.537 | 0.264 |
| 2.279999999999958 | 9.125 | 3.539 | 0.27 |
| 2.282999999999958 | 9.118 | 3.541 | 0.275 |
| 2.285999999999958 | 9.11 | 3.542 | 0.28 |
| 2.288999999999958 | 9.102 | 3.544 | 0.286 |
| 2.291999999999958 | 9.094 | 3.546 | 0.291 |
| 2.294999999999959 | 9.086 | 3.547 | 0.297 |
| 2.297999999999959 | 9.078 | 3.548 | 0.302 |
| 2.300999999999959 | 9.069 | 3.549 | 0.308 |
| 2.303999999999959 | 9.06 | 3.55 | 0.313 |
| 2.306999999999959 | 9.051 | 3.551 | 0.319 |
| 2.309999999999959 | 9.042 | 3.552 | 0.325 |
| 2.312999999999959 | 9.033 | 3.553 | 0.331 |
| 2.315999999999959 | 9.023 | 3.554 | 0.336 |
| 2.318999999999959 | 9.013 | 3.554 | 0.342 |
| 2.32199999999996 | 9.003 | 3.555 | 0.348 |
| 2.32499999999996 | 8.993 | 3.555 | 0.354 |
| 2.32799999999996 | 8.982 | 3.555 | 0.36 |
| 2.33099999999996 | 8.971 | 3.556 | 0.366 |
| 2.33399999999996 | 8.961 | 3.556 | 0.372 |
| 2.33699999999996 | 8.949 | 3.555 | 0.378 |
| 2.33999999999996 | 8.938 | 3.555 | 0.384 |
| 2.34299999999996 | 8.926 | 3.555 | 0.39 |
| 2.345999999999961 | 8.915 | 3.555 | 0.396 |
| 2.348999999999961 | 8.903 | 3.554 | 0.402 |
| 2.351999999999961 | 8.89 | 3.553 | 0.408 |
| 2.354999999999961 | 8.878 | 3.553 | 0.415 |
| 2.357999999999961 | 8.865 | 3.552 | 0.421 |
| 2.360999999999961 | 8.852 | 3.551 | 0.427 |
| 2.363999999999961 | 8.839 | 3.55 | 0.434 |
| 2.366999999999961 | 8.826 | 3.549 | 0.44 |
| 2.369999999999961 | 8.812 | 3.547 | 0.446 |
| 2.372999999999962 | 8.798 | 3.546 | 0.453 |
| 2.375999999999962 | 8.784 | 3.544 | 0.459 |
| 2.378999999999962 | 8.77 | 3.543 | 0.466 |
| 2.381999999999962 | 8.756 | 3.541 | 0.472 |
| 2.384999999999962 | 8.741 | 3.539 | 0.479 |
| 2.387999999999962 | 8.726 | 3.537 | 0.485 |
| 2.390999999999962 | 8.711 | 3.535 | 0.492 |
| 2.393999999999962 | 8.695 | 3.533 | 0.499 |
| 2.396999999999962 | 8.68 | 3.53 | 0.505 |
| 2.399999999999963 | 8.664 | 3.528 | 0.512 |
| 2.402999999999963 | 8.648 | 3.525 | 0.519 |
| 2.405999999999963 | 8.632 | 3.523 | 0.525 |
| 2.408999999999963 | 8.615 | 3.52 | 0.532 |
| 2.411999999999963 | 8.598 | 3.517 | 0.539 |
| 2.414999999999963 | 8.581 | 3.514 | 0.546 |
| 2.417999999999963 | 8.564 | 3.511 | 0.553 |
| 2.420999999999963 | 8.547 | 3.507 | 0.56 |
| 2.423999999999963 | 8.529 | 3.504 | 0.567 |
| 2.426999999999964 | 8.511 | 3.5 | 0.574 |
| 2.429999999999964 | 8.493 | 3.497 | 0.581 |
| 2.432999999999964 | 8.474 | 3.493 | 0.588 |
| 2.435999999999964 | 8.456 | 3.489 | 0.595 |
| 2.438999999999964 | 8.437 | 3.485 | 0.602 |
| 2.441999999999964 | 8.418 | 3.481 | 0.609 |
| 2.444999999999964 | 8.398 | 3.477 | 0.616 |
| 2.447999999999964 | 8.379 | 3.472 | 0.623 |
| 2.450999999999965 | 8.359 | 3.468 | 0.63 |
| 2.453999999999965 | 8.339 | 3.463 | 0.637 |
| 2.456999999999965 | 8.318 | 3.458 | 0.645 |
| 2.459999999999965 | 8.298 | 3.453 | 0.652 |
| 2.462999999999965 | 8.277 | 3.448 | 0.659 |
| 2.465999999999965 | 8.256 | 3.443 | 0.666 |
| 2.468999999999965 | 8.235 | 3.438 | 0.674 |
| 2.471999999999965 | 8.213 | 3.432 | 0.681 |
| 2.474999999999965 | 8.191 | 3.427 | 0.688 |
| 2.477999999999966 | 8.169 | 3.421 | 0.696 |
| 2.480999999999966 | 8.147 | 3.415 | 0.703 |
| 2.483999999999966 | 8.124 | 3.409 | 0.71 |
| 2.486999999999966 | 8.102 | 3.403 | 0.718 |
| 2.489999999999966 | 8.079 | 3.397 | 0.725 |
| 2.492999999999966 | 8.055 | 3.39 | 0.733 |
| 2.495999999999966 | 8.032 | 3.384 | 0.74 |
| 2.498999999999966 | 8.008 | 3.377 | 0.748 |
| 2.501999999999966 | 7.984 | 3.37 | 0.755 |
| 2.504999999999967 | 7.96 | 3.364 | 0.763 |
| 2.507999999999967 | 7.935 | 3.357 | 0.77 |
| 2.510999999999967 | 7.91 | 3.349 | 0.778 |
| 2.513999999999967 | 7.885 | 3.342 | 0.785 |
| 2.516999999999967 | 7.86 | 3.335 | 0.793 |
| 2.519999999999967 | 7.834 | 3.327 | 0.8 |
| 2.522999999999967 | 7.809 | 3.319 | 0.808 |
| 2.525999999999967 | 7.782 | 3.311 | 0.816 |
| 2.528999999999967 | 7.756 | 3.303 | 0.823 |
| 2.531999999999968 | 7.73 | 3.295 | 0.831 |
| 2.534999999999968 | 7.703 | 3.287 | 0.839 |
| 2.537999999999968 | 7.676 | 3.279 | 0.846 |
| 2.540999999999968 | 7.648 | 3.27 | 0.854 |
| 2.543999999999968 | 7.621 | 3.261 | 0.862 |
| 2.546999999999968 | 7.593 | 3.252 | 0.87 |
| 2.549999999999968 | 7.565 | 3.243 | 0.877 |
| 2.552999999999968 | 7.536 | 3.234 | 0.885 |
| 2.555999999999969 | 7.507 | 3.225 | 0.893 |
| 2.558999999999969 | 7.478 | 3.216 | 0.901 |
| 2.561999999999969 | 7.449 | 3.206 | 0.908 |
| 2.564999999999969 | 7.42 | 3.196 | 0.916 |
| 2.567999999999969 | 7.39 | 3.186 | 0.924 |
| 2.570999999999969 | 7.36 | 3.176 | 0.932 |
| 2.573999999999969 | 7.33 | 3.166 | 0.94 |
| 2.576999999999969 | 7.299 | 3.156 | 0.948 |
| 2.579999999999969 | 7.268 | 3.145 | 0.955 |
| 2.58299999999997 | 7.237 | 3.135 | 0.963 |
| 2.58599999999997 | 7.206 | 3.124 | 0.971 |
| 2.58899999999997 | 7.174 | 3.113 | 0.979 |
| 2.59199999999997 | 7.142 | 3.102 | 0.987 |
| 2.59499999999997 | 7.11 | 3.091 | 0.995 |
| 2.59799999999997 | 7.078 | 3.08 | 1.003 |
| 2.60099999999997 | 7.045 | 3.068 | 1.011 |
| 2.60399999999997 | 7.012 | 3.057 | 1.019 |
| 2.60699999999997 | 6.979 | 3.045 | 1.026 |
| 2.60999999999997 | 6.945 | 3.033 | 1.034 |
| 2.612999999999971 | 6.911 | 3.021 | 1.042 |
| 2.615999999999971 | 6.877 | 3.008 | 1.05 |
| 2.618999999999971 | 6.843 | 2.996 | 1.058 |
| 2.621999999999971 | 6.808 | 2.983 | 1.066 |
| 2.624999999999971 | 6.773 | 2.971 | 1.074 |
| 2.627999999999971 | 6.738 | 2.958 | 1.082 |
| 2.630999999999971 | 6.703 | 2.945 | 1.09 |
| 2.633999999999971 | 6.667 | 2.932 | 1.098 |
| 2.636999999999971 | 6.631 | 2.918 | 1.106 |
| 2.639999999999972 | 6.595 | 2.905 | 1.114 |
| 2.642999999999972 | 6.558 | 2.891 | 1.122 |
| 2.645999999999972 | 6.521 | 2.877 | 1.13 |
| 2.648999999999972 | 6.484 | 2.863 | 1.138 |
| 2.651999999999972 | 6.446 | 2.849 | 1.146 |
| 2.654999999999972 | 6.409 | 2.835 | 1.154 |
| 2.657999999999972 | 6.371 | 2.82 | 1.162 |
| 2.660999999999972 | 6.332 | 2.806 | 1.17 |
| 2.663999999999972 | 6.294 | 2.791 | 1.178 |
| 2.666999999999973 | 6.255 | 2.776 | 1.186 |
| 2.669999999999973 | 6.216 | 2.761 | 1.194 |
| 2.672999999999973 | 6.176 | 2.746 | 1.202 |
| 2.675999999999973 | 6.137 | 2.73 | 1.21 |
| 2.678999999999973 | 6.096 | 2.715 | 1.218 |
| 2.681999999999973 | 6.056 | 2.699 | 1.226 |
| 2.684999999999973 | 6.016 | 2.683 | 1.234 |
| 2.687999999999973 | 5.975 | 2.667 | 1.242 |
| 2.690999999999974 | 5.933 | 2.651 | 1.25 |
| 2.693999999999974 | 5.892 | 2.634 | 1.258 |
| 2.696999999999974 | 5.85 | 2.618 | 1.266 |
| 2.699999999999974 | 5.808 | 2.601 | 1.274 |
| 2.702999999999974 | 5.766 | 2.584 | 1.282 |
| 2.705999999999974 | 5.723 | 2.567 | 1.29 |
| 2.708999999999974 | 5.68 | 2.55 | 1.298 |
| 2.711999999999974 | 5.637 | 2.532 | 1.306 |
| 2.714999999999974 | 5.593 | 2.515 | 1.314 |
| 2.717999999999975 | 5.549 | 2.497 | 1.322 |
| 2.720999999999975 | 5.505 | 2.479 | 1.33 |
| 2.723999999999975 | 5.461 | 2.461 | 1.338 |
| 2.726999999999975 | 5.416 | 2.443 | 1.346 |
| 2.729999999999975 | 5.371 | 2.424 | 1.354 |
| 2.732999999999975 | 5.325 | 2.406 | 1.361 |
| 2.735999999999975 | 5.28 | 2.387 | 1.369 |
| 2.738999999999975 | 5.234 | 2.368 | 1.377 |
| 2.741999999999975 | 5.187 | 2.349 | 1.385 |
| 2.744999999999976 | 5.141 | 2.329 | 1.393 |
| 2.747999999999976 | 5.094 | 2.31 | 1.401 |
| 2.750999999999976 | 5.047 | 2.29 | 1.409 |
| 2.753999999999976 | 4.999 | 2.27 | 1.417 |
| 2.756999999999976 | 4.951 | 2.25 | 1.425 |
| 2.759999999999976 | 4.903 | 2.23 | 1.432 |
| 2.762999999999976 | 4.855 | 2.21 | 1.44 |
| 2.765999999999976 | 4.806 | 2.189 | 1.448 |
| 2.768999999999976 | 4.757 | 2.169 | 1.456 |
| 2.771999999999977 | 4.708 | 2.148 | 1.464 |
| 2.774999999999977 | 4.658 | 2.127 | 1.472 |
| 2.777999999999977 | 4.608 | 2.105 | 1.479 |
| 2.780999999999977 | 4.558 | 2.084 | 1.487 |
| 2.783999999999977 | 4.507 | 2.062 | 1.495 |
| 2.786999999999977 | 4.456 | 2.041 | 1.503 |
| 2.789999999999977 | 4.405 | 2.019 | 1.51 |
| 2.792999999999977 | 4.353 | 1.996 | 1.518 |
| 2.795999999999978 | 4.302 | 1.974 | 1.526 |
| 2.798999999999978 | 4.249 | 1.952 | 1.533 |
| 2.801999999999978 | 4.197 | 1.929 | 1.541 |
| 2.804999999999978 | 4.144 | 1.906 | 1.549 |
| 2.807999999999978 | 4.091 | 1.883 | 1.556 |
| 2.810999999999978 | 4.038 | 1.86 | 1.564 |
| 2.813999999999978 | 3.984 | 1.836 | 1.572 |
| 2.816999999999978 | 3.93 | 1.813 | 1.579 |
| 2.819999999999978 | 3.875 | 1.789 | 1.587 |
| 2.822999999999979 | 3.821 | 1.765 | 1.594 |
| 2.825999999999979 | 3.766 | 1.74 | 1.602 |
| 2.828999999999979 | 3.71 | 1.716 | 1.61 |
| 2.831999999999979 | 3.654 | 1.692 | 1.617 |
| 2.834999999999979 | 3.598 | 1.667 | 1.625 |
| 2.837999999999979 | 3.542 | 1.642 | 1.632 |
| 2.840999999999979 | 3.485 | 1.617 | 1.639 |
| 2.843999999999979 | 3.428 | 1.591 | 1.647 |
| 2.846999999999979 | 3.371 | 1.566 | 1.654 |
| 2.84999999999998 | 3.314 | 1.54 | 1.662 |
| 2.85299999999998 | 3.256 | 1.514 | 1.669 |
| 2.85599999999998 | 3.197 | 1.488 | 1.676 |
| 2.85899999999998 | 3.139 | 1.462 | 1.684 |
| 2.86199999999998 | 3.08 | 1.435 | 1.691 |
| 2.86499999999998 | 3.02 | 1.409 | 1.698 |
| 2.86799999999998 | 2.961 | 1.382 | 1.706 |
| 2.87099999999998 | 2.901 | 1.355 | 1.713 |
| 2.873999999999981 | 2.84 | 1.327 | 1.72 |
| 2.876999999999981 | 2.78 | 1.3 | 1.727 |
| 2.879999999999981 | 2.719 | 1.272 | 1.735 |
| 2.882999999999981 | 2.658 | 1.245 | 1.742 |
| 2.885999999999981 | 2.596 | 1.216 | 1.749 |
| 2.888999999999981 | 2.534 | 1.188 | 1.756 |
| 2.891999999999981 | 2.472 | 1.16 | 1.763 |
| 2.894999999999981 | 2.409 | 1.131 | 1.77 |
| 2.897999999999981 | 2.346 | 1.102 | 1.777 |
| 2.900999999999982 | 2.283 | 1.073 | 1.784 |
| 2.903999999999982 | 2.219 | 1.044 | 1.791 |
| 2.906999999999982 | 2.155 | 1.015 | 1.798 |
| 2.909999999999982 | 2.091 | 0.985 | 1.805 |
| 2.912999999999982 | 2.026 | 0.955 | 1.812 |
| 2.915999999999982 | 1.961 | 0.925 | 1.819 |
| 2.918999999999982 | 1.896 | 0.895 | 1.826 |
| 2.921999999999982 | 1.83 | 0.864 | 1.833 |
| 2.924999999999982 | 1.764 | 0.834 | 1.84 |
| 2.927999999999983 | 1.698 | 0.803 | 1.846 |
| 2.930999999999983 | 1.631 | 0.772 | 1.853 |
| 2.933999999999983 | 1.564 | 0.741 | 1.86 |
| 2.936999999999983 | 1.497 | 0.709 | 1.867 |
| 2.939999999999983 | 1.429 | 0.677 | 1.873 |
| 2.942999999999983 | 1.361 | 0.646 | 1.88 |
| 2.945999999999983 | 1.292 | 0.613 | 1.886 |
| 2.948999999999983 | 1.224 | 0.581 | 1.893 |
| 2.951999999999983 | 1.154 | 0.549 | 1.9 |
| 2.954999999999984 | 1.085 | 0.516 | 1.906 |
| 2.957999999999984 | 1.015 | 0.483 | 1.913 |
| 2.960999999999984 | 0.945 | 0.45 | 1.919 |
| 2.963999999999984 | 0.874 | 0.417 | 1.926 |
| 2.966999999999984 | 0.803 | 0.383 | 1.932 |
| 2.969999999999984 | 0.732 | 0.349 | 1.938 |
| 2.972999999999984 | 0.66 | 0.315 | 1.945 |
| 2.975999999999984 | 0.589 | 0.281 | 1.951 |
| 2.978999999999985 | 0.516 | 0.247 | 1.957 |
| 2.981999999999985 | 0.444 | 0.212 | 1.963 |
| 2.984999999999985 | 0.371 | 0.177 | 1.97 |
| 2.987999999999985 | 0.297 | 0.142 | 1.976 |
| 2.990999999999985 | 0.223 | 0.107 | 1.982 |
| 2.993999999999985 | 0.149 | 0.072 | 1.988 |
| 2.996999999999985 | 0.075 | 0.036 | 1.994 |
| 2.999999999999985 | 0 | 0 | 2 |
| 3.002999999999985 | -0.075 | -0.036 | 2.006 |
| 3.005999999999986 | -0.151 | -0.072 | 2.012 |
| 3.008999999999986 | -0.227 | -0.109 | 2.018 |
| 3.011999999999986 | -0.303 | -0.146 | 2.024 |
| 3.014999999999986 | -0.38 | -0.183 | 2.03 |
| 3.017999999999986 | -0.457 | -0.22 | 2.035 |
| 3.020999999999986 | -0.534 | -0.257 | 2.041 |
| 3.023999999999986 | -0.612 | -0.295 | 2.047 |
| 3.026999999999986 | -0.69 | -0.333 | 2.053 |
| 3.029999999999986 | -0.768 | -0.371 | 2.058 |
| 3.032999999999987 | -0.847 | -0.409 | 2.064 |
| 3.035999999999987 | -0.926 | -0.448 | 2.069 |
| 3.038999999999987 | -1.006 | -0.486 | 2.075 |
| 3.041999999999987 | -1.086 | -0.525 | 2.08 |
| 3.044999999999987 | -1.166 | -0.565 | 2.086 |
| 3.047999999999987 | -1.247 | -0.604 | 2.091 |
| 3.050999999999987 | -1.328 | -0.644 | 2.097 |
| 3.053999999999987 | -1.409 | -0.683 | 2.102 |
| 3.056999999999987 | -1.491 | -0.724 | 2.107 |
| 3.059999999999988 | -1.573 | -0.764 | 2.112 |
| 3.062999999999988 | -1.655 | -0.804 | 2.118 |
| 3.065999999999988 | -1.738 | -0.845 | 2.123 |
| 3.068999999999988 | -1.822 | -0.886 | 2.128 |
| 3.071999999999988 | -1.905 | -0.927 | 2.133 |
| 3.074999999999988 | -1.989 | -0.969 | 2.138 |
| 3.077999999999988 | -2.074 | -1.01 | 2.143 |
| 3.080999999999988 | -2.158 | -1.052 | 2.148 |
| 3.083999999999989 | -2.243 | -1.094 | 2.153 |
| 3.086999999999989 | -2.329 | -1.137 | 2.158 |
| 3.089999999999989 | -2.415 | -1.179 | 2.162 |
| 3.092999999999989 | -2.501 | -1.222 | 2.167 |
| 3.095999999999989 | -2.588 | -1.265 | 2.172 |
| 3.098999999999989 | -2.675 | -1.309 | 2.176 |
| 3.101999999999989 | -2.762 | -1.352 | 2.181 |
| 3.104999999999989 | -2.85 | -1.396 | 2.186 |
| 3.107999999999989 | -2.938 | -1.44 | 2.19 |
| 3.11099999999999 | -3.027 | -1.484 | 2.195 |
| 3.11399999999999 | -3.116 | -1.528 | 2.199 |
| 3.11699999999999 | -3.205 | -1.573 | 2.203 |
| 3.11999999999999 | -3.295 | -1.618 | 2.208 |
| 3.12299999999999 | -3.385 | -1.663 | 2.212 |
| 3.12599999999999 | -3.476 | -1.709 | 2.216 |
| 3.12899999999999 | -3.566 | -1.754 | 2.22 |
| 3.13199999999999 | -3.658 | -1.8 | 2.225 |
| 3.13499999999999 | -3.749 | -1.846 | 2.229 |
| 3.137999999999991 | -3.841 | -1.892 | 2.233 |
| 3.140999999999991 | -3.934 | -1.939 | 2.237 |
| 3.143999999999991 | -4.027 | -1.986 | 2.241 |
| 3.146999999999991 | -4.12 | -2.033 | 2.244 |
| 3.149999999999991 | -4.213 | -2.08 | 2.248 |
| 3.152999999999991 | -4.308 | -2.128 | 2.252 |
| 3.155999999999991 | -4.402 | -2.175 | 2.256 |
| 3.158999999999991 | -4.497 | -2.223 | 2.259 |
| 3.161999999999991 | -4.592 | -2.272 | 2.263 |
| 3.164999999999992 | -4.687 | -2.32 | 2.267 |
| 3.167999999999992 | -4.783 | -2.369 | 2.27 |
| 3.170999999999992 | -4.88 | -2.418 | 2.274 |
| 3.173999999999992 | -4.977 | -2.467 | 2.277 |
| 3.176999999999992 | -5.074 | -2.517 | 2.28 |
| 3.179999999999992 | -5.171 | -2.566 | 2.284 |
| 3.182999999999992 | -5.269 | -2.616 | 2.287 |
| 3.185999999999992 | -5.368 | -2.666 | 2.29 |
| 3.188999999999992 | -5.466 | -2.717 | 2.293 |
| 3.191999999999993 | -5.566 | -2.768 | 2.296 |
| 3.194999999999993 | -5.665 | -2.819 | 2.299 |
| 3.197999999999993 | -5.765 | -2.87 | 2.302 |
| 3.200999999999993 | -5.866 | -2.921 | 2.305 |
| 3.203999999999993 | -5.966 | -2.973 | 2.308 |
| 3.206999999999993 | -6.067 | -3.025 | 2.311 |
| 3.209999999999993 | -6.169 | -3.077 | 2.313 |
| 3.212999999999993 | -6.271 | -3.129 | 2.316 |
| 3.215999999999994 | -6.373 | -3.182 | 2.319 |
| 3.218999999999994 | -6.476 | -3.235 | 2.321 |
| 3.221999999999994 | -6.579 | -3.288 | 2.324 |
| 3.224999999999994 | -6.683 | -3.342 | 2.326 |
| 3.227999999999994 | -6.787 | -3.395 | 2.328 |
| 3.230999999999994 | -6.892 | -3.449 | 2.331 |
| 3.233999999999994 | -6.996 | -3.504 | 2.333 |
| 3.236999999999994 | -7.102 | -3.558 | 2.335 |
| 3.239999999999994 | -7.207 | -3.613 | 2.337 |
| 3.242999999999995 | -7.313 | -3.668 | 2.339 |
| 3.245999999999995 | -7.42 | -3.723 | 2.341 |
| 3.248999999999995 | -7.527 | -3.778 | 2.343 |
| 3.251999999999995 | -7.634 | -3.834 | 2.345 |
| 3.254999999999995 | -7.742 | -3.89 | 2.347 |
| 3.257999999999995 | -7.85 | -3.946 | 2.349 |
| 3.260999999999995 | -7.959 | -4.003 | 2.35 |
| 3.263999999999995 | -8.068 | -4.06 | 2.352 |
| 3.266999999999995 | -8.177 | -4.117 | 2.353 |
| 3.269999999999996 | -8.287 | -4.174 | 2.355 |
| 3.272999999999996 | -8.397 | -4.231 | 2.356 |
| 3.275999999999996 | -8.508 | -4.289 | 2.358 |
| 3.278999999999996 | -8.619 | -4.347 | 2.359 |
| 3.281999999999996 | -8.73 | -4.406 | 2.36 |
| 3.284999999999996 | -8.842 | -4.464 | 2.361 |
| 3.287999999999996 | -8.954 | -4.523 | 2.362 |
| 3.290999999999996 | -9.067 | -4.582 | 2.363 |
| 3.293999999999996 | -9.18 | -4.641 | 2.364 |
| 3.296999999999997 | -9.294 | -4.701 | 2.365 |
| 3.299999999999997 | -9.408 | -4.761 | 2.366 |
| 3.302999999999997 | -9.522 | -4.821 | 2.367 |
| 3.305999999999997 | -9.637 | -4.882 | 2.367 |
| 3.308999999999997 | -9.753 | -4.942 | 2.368 |
| 3.311999999999997 | -9.868 | -5.003 | 2.369 |
| 3.314999999999997 | -9.985 | -5.064 | 2.369 |
| 3.317999999999997 | -10.101 | -5.126 | 2.369 |
| 3.320999999999997 | -10.218 | -5.188 | 2.37 |
| 3.323999999999998 | -10.336 | -5.25 | 2.37 |
| 3.326999999999998 | -10.453 | -5.312 | 2.37 |
| 3.329999999999998 | -10.572 | -5.375 | 2.37 |
| 3.332999999999998 | -10.69 | -5.437 | 2.37 |
| 3.335999999999998 | -10.81 | -5.501 | 2.37 |
| 3.338999999999998 | -10.929 | -5.564 | 2.37 |
| 3.341999999999998 | -11.049 | -5.628 | 2.37 |
| 3.344999999999998 | -11.17 | -5.691 | 2.37 |
| 3.347999999999998 | -11.291 | -5.756 | 2.37 |
| 3.350999999999999 | -11.412 | -5.82 | 2.369 |
| 3.353999999999999 | -11.534 | -5.885 | 2.369 |
| 3.356999999999999 | -11.656 | -5.95 | 2.368 |
| 3.359999999999999 | -11.779 | -6.015 | 2.367 |
| 3.362999999999999 | -11.902 | -6.081 | 2.367 |
| 3.365999999999999 | -12.025 | -6.147 | 2.366 |
| 3.368999999999999 | -12.149 | -6.213 | 2.365 |
| 3.371999999999999 | -12.274 | -6.279 | 2.364 |
| 3.375 | -12.398 | -6.346 | 2.363 |
| 3.378 | -12.524 | -6.413 | 2.362 |
| 3.381 | -12.649 | -6.48 | 2.361 |
| 3.384 | -12.776 | -6.547 | 2.36 |
| 3.387 | -12.902 | -6.615 | 2.359 |
| 3.39 | -13.029 | -6.683 | 2.357 |
| 3.393 | -13.157 | -6.751 | 2.356 |
| 3.396 | -13.285 | -6.82 | 2.354 |
| 3.399 | -13.413 | -6.889 | 2.353 |
| 3.402000000000001 | -13.542 | -6.958 | 2.351 |
| 3.405000000000001 | -13.671 | -7.028 | 2.349 |
| 3.408000000000001 | -13.801 | -7.097 | 2.347 |
| 3.411000000000001 | -13.931 | -7.167 | 2.345 |
| 3.414000000000001 | -14.062 | -7.238 | 2.343 |
| 3.417000000000001 | -14.193 | -7.308 | 2.341 |
| 3.420000000000001 | -14.324 | -7.379 | 2.339 |
| 3.423000000000001 | -14.456 | -7.45 | 2.337 |
| 3.426000000000001 | -14.589 | -7.522 | 2.334 |
| 3.429000000000002 | -14.722 | -7.593 | 2.332 |
| 3.432000000000002 | -14.855 | -7.665 | 2.33 |
| 3.435000000000002 | -14.989 | -7.738 | 2.327 |
| 3.438000000000002 | -15.123 | -7.81 | 2.324 |
| 3.441000000000002 | -15.258 | -7.883 | 2.322 |
| 3.444000000000002 | -15.393 | -7.956 | 2.319 |
| 3.447000000000002 | -15.528 | -8.03 | 2.316 |
| 3.450000000000002 | -15.665 | -8.103 | 2.313 |
| 3.453000000000002 | -15.801 | -8.177 | 2.31 |
| 3.456000000000003 | -15.938 | -8.252 | 2.306 |
| 3.459000000000003 | -16.075 | -8.326 | 2.303 |
| 3.462000000000003 | -16.213 | -8.401 | 2.3 |
| 3.465000000000003 | -16.352 | -8.476 | 2.296 |
| 3.468000000000003 | -16.49 | -8.552 | 2.293 |
| 3.471000000000003 | -16.63 | -8.628 | 2.289 |
| 3.474000000000003 | -16.77 | -8.704 | 2.286 |
| 3.477000000000003 | -16.91 | -8.78 | 2.282 |
| 3.480000000000003 | -17.05 | -8.857 | 2.278 |
| 3.483000000000004 | -17.191 | -8.934 | 2.274 |
| 3.486000000000004 | -17.333 | -9.011 | 2.27 |
| 3.489000000000004 | -17.475 | -9.088 | 2.266 |
| 3.492000000000004 | -17.618 | -9.166 | 2.262 |
| 3.495000000000004 | -17.761 | -9.244 | 2.257 |
| 3.498000000000004 | -17.904 | -9.323 | 2.253 |
| 3.501000000000004 | -18.048 | -9.401 | 2.248 |
| 3.504000000000004 | -18.192 | -9.48 | 2.244 |
| 3.507000000000005 | -18.337 | -9.56 | 2.239 |
| 3.510000000000005 | -18.483 | -9.639 | 2.234 |
| 3.513000000000005 | -18.628 | -9.719 | 2.23 |
| 3.516000000000005 | -18.775 | -9.799 | 2.225 |
| 3.519000000000005 | -18.921 | -9.88 | 2.22 |
| 3.522000000000005 | -19.069 | -9.961 | 2.215 |
| 3.525000000000005 | -19.216 | -10.042 | 2.209 |
| 3.528000000000005 | -19.364 | -10.123 | 2.204 |
| 3.531000000000005 | -19.513 | -10.205 | 2.199 |
| 3.534000000000006 | -19.662 | -10.287 | 2.193 |
| 3.537000000000006 | -19.812 | -10.369 | 2.188 |
| 3.540000000000006 | -19.962 | -10.452 | 2.182 |
| 3.543000000000006 | -20.112 | -10.534 | 2.176 |
| 3.546000000000006 | -20.263 | -10.618 | 2.17 |
| 3.549000000000006 | -20.415 | -10.701 | 2.164 |
| 3.552000000000006 | -20.567 | -10.785 | 2.158 |
| 3.555000000000006 | -20.719 | -10.869 | 2.152 |
| 3.558000000000006 | -20.872 | -10.954 | 2.146 |
| 3.561000000000007 | -21.026 | -11.038 | 2.139 |
| 3.564000000000007 | -21.18 | -11.123 | 2.133 |
| 3.567000000000007 | -21.334 | -11.209 | 2.126 |
| 3.570000000000007 | -21.489 | -11.294 | 2.12 |
| 3.573000000000007 | -21.644 | -11.38 | 2.113 |
| 3.576000000000007 | -21.8 | -11.467 | 2.106 |
| 3.579000000000007 | -21.956 | -11.553 | 2.099 |
| 3.582000000000007 | -22.113 | -11.64 | 2.092 |
| 3.585000000000007 | -22.27 | -11.727 | 2.085 |
| 3.588000000000008 | -22.428 | -11.815 | 2.078 |
| 3.591000000000008 | -22.586 | -11.903 | 2.071 |
| 3.594000000000008 | -22.745 | -11.991 | 2.063 |
| 3.597000000000008 | -22.904 | -12.079 | 2.056 |
| 3.600000000000008 | -23.064 | -12.168 | 2.048 |
| 3.603000000000008 | -23.224 | -12.257 | 2.04 |
| 3.606000000000008 | -23.385 | -12.346 | 2.032 |
| 3.609000000000008 | -23.546 | -12.436 | 2.025 |
| 3.612000000000008 | -23.708 | -12.526 | 2.016 |
| 3.615000000000009 | -23.87 | -12.617 | 2.008 |
| 3.618000000000009 | -24.033 | -12.707 | 2 |
| 3.621000000000009 | -24.196 | -12.798 | 1.992 |
| 3.624000000000009 | -24.359 | -12.889 | 1.983 |
| 3.62700000000001 | -24.524 | -12.981 | 1.975 |
| 3.630000000000009 | -24.688 | -13.073 | 1.966 |
| 3.633000000000009 | -24.853 | -13.165 | 1.957 |
| 3.636000000000009 | -25.019 | -13.258 | 1.948 |
| 3.639000000000009 | -25.185 | -13.351 | 1.94 |
| 3.64200000000001 | -25.352 | -13.444 | 1.93 |
| 3.64500000000001 | -25.519 | -13.537 | 1.921 |
| 3.64800000000001 | -25.686 | -13.631 | 1.912 |
| 3.65100000000001 | -25.855 | -13.725 | 1.903 |
| 3.65400000000001 | -26.023 | -13.82 | 1.893 |
| 3.65700000000001 | -26.192 | -13.915 | 1.884 |
| 3.66000000000001 | -26.362 | -14.01 | 1.874 |
| 3.66300000000001 | -26.532 | -14.105 | 1.864 |
| 3.66600000000001 | -26.703 | -14.201 | 1.854 |
| 3.669000000000011 | -26.874 | -14.297 | 1.844 |
| 3.672000000000011 | -27.046 | -14.393 | 1.834 |
| 3.675000000000011 | -27.218 | -14.49 | 1.824 |
| 3.678000000000011 | -27.39 | -14.587 | 1.813 |
| 3.681000000000011 | -27.564 | -14.685 | 1.803 |
| 3.684000000000011 | -27.737 | -14.782 | 1.792 |
| 3.687000000000011 | -27.911 | -14.88 | 1.782 |
| 3.690000000000011 | -28.086 | -14.979 | 1.771 |
| 3.693000000000011 | -28.261 | -15.077 | 1.76 |
| 3.696000000000012 | -28.437 | -15.176 | 1.749 |
| 3.699000000000012 | -28.613 | -15.276 | 1.738 |
| 3.702000000000012 | -28.79 | -15.375 | 1.726 |
| 3.705000000000012 | -28.967 | -15.476 | 1.715 |
| 3.708000000000012 | -29.145 | -15.576 | 1.704 |
| 3.711000000000012 | -29.323 | -15.677 | 1.692 |
| 3.714000000000012 | -29.502 | -15.778 | 1.68 |
| 3.717000000000012 | -29.681 | -15.879 | 1.669 |
| 3.720000000000012 | -29.861 | -15.981 | 1.657 |
| 3.723000000000012 | -30.041 | -16.083 | 1.645 |
| 3.726000000000013 | -30.222 | -16.185 | 1.633 |
| 3.729000000000013 | -30.404 | -16.288 | 1.62 |
| 3.732000000000013 | -30.585 | -16.391 | 1.608 |
| 3.735000000000013 | -30.768 | -16.494 | 1.595 |
| 3.738000000000013 | -30.951 | -16.598 | 1.583 |
| 3.741000000000013 | -31.134 | -16.702 | 1.57 |
| 3.744000000000013 | -31.318 | -16.806 | 1.557 |
| 3.747000000000013 | -31.503 | -16.911 | 1.544 |
| 3.750000000000014 | -31.688 | -17.016 | 1.531 |
| 3.753000000000014 | -31.873 | -17.121 | 1.518 |
| 3.756000000000014 | -32.059 | -17.227 | 1.505 |
| 3.759000000000014 | -32.246 | -17.333 | 1.491 |
| 3.762000000000014 | -32.433 | -17.439 | 1.478 |
| 3.765000000000014 | -32.62 | -17.546 | 1.464 |
| 3.768000000000014 | -32.808 | -17.653 | 1.45 |
| 3.771000000000014 | -32.997 | -17.76 | 1.436 |
| 3.774000000000015 | -33.186 | -17.868 | 1.422 |
| 3.777000000000015 | -33.376 | -17.976 | 1.408 |
| 3.780000000000015 | -33.566 | -18.084 | 1.394 |
| 3.783000000000015 | -33.757 | -18.193 | 1.38 |
| 3.786000000000015 | -33.948 | -18.302 | 1.365 |
| 3.789000000000015 | -34.14 | -18.412 | 1.351 |
| 3.792000000000015 | -34.332 | -18.522 | 1.336 |
| 3.795000000000015 | -34.525 | -18.632 | 1.321 |
| 3.798000000000015 | -34.719 | -18.742 | 1.306 |
| 3.801000000000016 | -34.913 | -18.853 | 1.291 |
| 3.804000000000016 | -35.107 | -18.964 | 1.276 |
| 3.807000000000016 | -35.302 | -19.076 | 1.26 |
| 3.810000000000016 | -35.498 | -19.188 | 1.245 |
| 3.813000000000016 | -35.694 | -19.3 | 1.229 |
| 3.816000000000016 | -35.89 | -19.412 | 1.214 |
| 3.819000000000016 | -36.088 | -19.525 | 1.198 |
| 3.822000000000016 | -36.285 | -19.638 | 1.182 |
| 3.825000000000017 | -36.484 | -19.752 | 1.166 |
| 3.828000000000017 | -36.682 | -19.866 | 1.15 |
| 3.831000000000017 | -36.882 | -19.98 | 1.133 |
| 3.834000000000017 | -37.081 | -20.095 | 1.117 |
| 3.837000000000017 | -37.282 | -20.21 | 1.1 |
| 3.840000000000017 | -37.483 | -20.325 | 1.083 |
| 3.843000000000017 | -37.684 | -20.441 | 1.067 |
| 3.846000000000017 | -37.886 | -20.557 | 1.05 |
| 3.849000000000017 | -38.089 | -20.673 | 1.032 |
| 3.852000000000018 | -38.292 | -20.79 | 1.015 |
| 3.855000000000018 | -38.496 | -20.907 | 0.998 |
| 3.858000000000018 | -38.7 | -21.025 | 0.98 |
| 3.861000000000018 | -38.905 | -21.143 | 0.963 |
| 3.864000000000018 | -39.11 | -21.261 | 0.945 |
| 3.867000000000018 | -39.316 | -21.379 | 0.927 |
| 3.870000000000018 | -39.522 | -21.498 | 0.909 |
| 3.873000000000018 | -39.729 | -21.618 | 0.891 |
| 3.876000000000018 | -39.936 | -21.737 | 0.873 |
| 3.879000000000019 | -40.144 | -21.857 | 0.854 |
| 3.882000000000019 | -40.353 | -21.977 | 0.836 |
| 3.885000000000019 | -40.562 | -22.098 | 0.817 |
| 3.888000000000019 | -40.772 | -22.219 | 0.798 |
| 3.891000000000019 | -40.982 | -22.341 | 0.78 |
| 3.894000000000019 | -41.193 | -22.462 | 0.76 |
| 3.897000000000019 | -41.404 | -22.585 | 0.741 |
| 3.900000000000019 | -41.616 | -22.707 | 0.722 |
| 3.90300000000002 | -41.828 | -22.83 | 0.703 |
| 3.90600000000002 | -42.041 | -22.953 | 0.683 |
| 3.90900000000002 | -42.255 | -23.077 | 0.663 |
| 3.91200000000002 | -42.469 | -23.201 | 0.643 |
| 3.91500000000002 | -42.684 | -23.325 | 0.623 |
| 3.91800000000002 | -42.899 | -23.45 | 0.603 |
| 3.92100000000002 | -43.115 | -23.575 | 0.583 |
| 3.92400000000002 | -43.331 | -23.7 | 0.563 |
| 3.92700000000002 | -43.548 | -23.826 | 0.542 |
| 3.930000000000021 | -43.765 | -23.952 | 0.521 |
| 3.933000000000021 | -43.983 | -24.078 | 0.501 |
| 3.936000000000021 | -44.202 | -24.205 | 0.48 |
| 3.939000000000021 | -44.421 | -24.332 | 0.459 |
| 3.942000000000021 | -44.641 | -24.46 | 0.437 |
| 3.945000000000021 | -44.861 | -24.588 | 0.416 |
| 3.948000000000021 | -45.082 | -24.716 | 0.395 |
| 3.951000000000021 | -45.303 | -24.845 | 0.373 |
| 3.954000000000021 | -45.525 | -24.974 | 0.351 |
| 3.957000000000022 | -45.748 | -25.104 | 0.329 |
| 3.960000000000022 | -45.971 | -25.233 | 0.307 |
| 3.963000000000022 | -46.195 | -25.364 | 0.285 |
| 3.966000000000022 | -46.419 | -25.494 | 0.263 |
| 3.969000000000022 | -46.644 | -25.625 | 0.24 |
| 3.972000000000022 | -46.869 | -25.756 | 0.218 |
| 3.975000000000022 | -47.095 | -25.888 | 0.195 |
| 3.978000000000022 | -47.321 | -26.02 | 0.172 |
| 3.981000000000022 | -47.549 | -26.153 | 0.149 |
| 3.984000000000023 | -47.776 | -26.285 | 0.126 |
| 3.987000000000023 | -48.004 | -26.419 | 0.103 |
| 3.990000000000023 | -48.233 | -26.552 | 0.079 |
| 3.993000000000023 | -48.463 | -26.686 | 0.056 |
| 3.996000000000023 | -48.693 | -26.82 | 0.032 |
| 3.999000000000023 | -48.923 | -26.955 | 0.008 |
| 4.002000000000023 | -49.154 | -27.09 | -0.016 |
| 4.005000000000023 | -49.386 | -27.226 | -0.04 |
| 4.008000000000023 | -49.618 | -27.361 | -0.065 |
| 4.011000000000023 | -49.851 | -27.498 | -0.089 |
| 4.014000000000023 | -50.084 | -27.634 | -0.114 |
| 4.017000000000023 | -50.318 | -27.771 | -0.138 |
| 4.020000000000024 | -50.553 | -27.908 | -0.163 |
| 4.023000000000024 | -50.788 | -28.046 | -0.188 |
| 4.026000000000024 | -51.024 | -28.184 | -0.213 |
| 4.029000000000024 | -51.26 | -28.323 | -0.239 |
| 4.032000000000024 | -51.497 | -28.462 | -0.264 |
| 4.035000000000024 | -51.734 | -28.601 | -0.29 |
| 4.038000000000024 | -51.972 | -28.74 | -0.316 |
| 4.041000000000024 | -52.211 | -28.881 | -0.342 |
| 4.044000000000024 | -52.45 | -29.021 | -0.368 |
| 4.047000000000024 | -52.69 | -29.162 | -0.394 |
| 4.050000000000024 | -52.931 | -29.303 | -0.42 |
| 4.053000000000024 | -53.171 | -29.444 | -0.447 |
| 4.056000000000024 | -53.413 | -29.586 | -0.473 |
| 4.059000000000025 | -53.655 | -29.729 | -0.5 |
| 4.062000000000025 | -53.898 | -29.871 | -0.527 |
| 4.065000000000025 | -54.141 | -30.015 | -0.554 |
| 4.068000000000025 | -54.385 | -30.158 | -0.582 |
| 4.071000000000025 | -54.63 | -30.302 | -0.609 |
| 4.074000000000025 | -54.875 | -30.446 | -0.637 |
| 4.077000000000025 | -55.121 | -30.591 | -0.664 |
| 4.080000000000025 | -55.367 | -30.736 | -0.692 |
| 4.083000000000025 | -55.614 | -30.881 | -0.72 |
| 4.086000000000026 | -55.861 | -31.027 | -0.748 |
| 4.089000000000026 | -56.109 | -31.173 | -0.777 |
| 4.092000000000026 | -56.358 | -31.32 | -0.805 |
| 4.095000000000026 | -56.607 | -31.467 | -0.834 |
| 4.098000000000026 | -56.857 | -31.615 | -0.863 |
| 4.101000000000026 | -57.108 | -31.762 | -0.892 |
| 4.104000000000027 | -57.359 | -31.911 | -0.921 |
| 4.107000000000027 | -57.61 | -32.059 | -0.95 |
| 4.110000000000027 | -57.863 | -32.208 | -0.979 |
| 4.113000000000027 | -58.115 | -32.357 | -1.009 |
| 4.116000000000027 | -58.369 | -32.507 | -1.039 |
| 4.119000000000027 | -58.623 | -32.657 | -1.069 |
| 4.122000000000027 | -58.878 | -32.808 | -1.099 |
| 4.125000000000028 | -59.133 | -32.959 | -1.129 |
| 4.128000000000028 | -59.389 | -33.11 | -1.159 |
| 4.131000000000027 | -59.645 | -33.262 | -1.19 |
| 4.134000000000028 | -59.902 | -33.414 | -1.22 |
| 4.137000000000028 | -60.16 | -33.567 | -1.251 |
| 4.140000000000028 | -60.418 | -33.72 | -1.282 |
| 4.143000000000028 | -60.677 | -33.873 | -1.313 |
| 4.146000000000028 | -60.937 | -34.027 | -1.345 |
| 4.149000000000028 | -61.197 | -34.181 | -1.376 |
| 4.152000000000029 | -61.457 | -34.336 | -1.408 |
| 4.155000000000029 | -61.719 | -34.491 | -1.44 |
| 4.158000000000029 | -61.981 | -34.646 | -1.472 |
| 4.161000000000029 | -62.243 | -34.802 | -1.504 |
| 4.164000000000029 | -62.506 | -34.958 | -1.536 |
| 4.167000000000029 | -62.77 | -35.115 | -1.568 |
| 4.17000000000003 | -63.034 | -35.272 | -1.601 |
| 4.17300000000003 | -63.299 | -35.429 | -1.634 |
| 4.17600000000003 | -63.565 | -35.587 | -1.667 |
| 4.17900000000003 | -63.831 | -35.745 | -1.7 |
| 4.18200000000003 | -64.098 | -35.904 | -1.733 |
| 4.18500000000003 | -64.366 | -36.063 | -1.766 |
| 4.18800000000003 | -64.634 | -36.222 | -1.8 |
| 4.19100000000003 | -64.902 | -36.382 | -1.834 |
| 4.19400000000003 | -65.172 | -36.542 | -1.868 |
| 4.19700000000003 | -65.441 | -36.703 | -1.902 |
| 4.20000000000003 | -65.712 | -36.864 | -1.936 |
| 4.20300000000003 | -65.983 | -37.025 | -1.97 |
| 4.20600000000003 | -66.255 | -37.187 | -2.005 |
| 4.20900000000003 | -66.527 | -37.35 | -2.04 |
| 4.212000000000031 | -66.8 | -37.512 | -2.075 |
| 4.215000000000031 | -67.074 | -37.676 | -2.11 |
| 4.218000000000031 | -67.348 | -37.839 | -2.145 |
| 4.221000000000031 | -67.623 | -38.003 | -2.18 |
| 4.224000000000031 | -67.899 | -38.167 | -2.216 |
| 4.227000000000031 | -68.175 | -38.332 | -2.252 |
| 4.230000000000031 | -68.451 | -38.497 | -2.288 |
| 4.233000000000031 | -68.729 | -38.663 | -2.324 |
| 4.236000000000031 | -69.007 | -38.829 | -2.36 |
| 4.239000000000031 | -69.285 | -38.995 | -2.396 |
| 4.242000000000032 | -69.565 | -39.162 | -2.433 |
| 4.245000000000032 | -69.845 | -39.33 | -2.47 |
| 4.248000000000032 | -70.125 | -39.497 | -2.507 |
| 4.251000000000032 | -70.406 | -39.665 | -2.544 |
| 4.254000000000032 | -70.688 | -39.834 | -2.581 |
| 4.257000000000033 | -70.97 | -40.003 | -2.618 |
| 4.260000000000033 | -71.254 | -40.172 | -2.656 |
| 4.263000000000033 | -71.537 | -40.342 | -2.694 |
| 4.266000000000033 | -71.821 | -40.512 | -2.732 |
| 4.269000000000033 | -72.106 | -40.683 | -2.77 |
| 4.272000000000033 | -72.392 | -40.854 | -2.808 |
| 4.275000000000033 | -72.678 | -41.026 | -2.847 |
| 4.278000000000033 | -72.965 | -41.197 | -2.885 |
| 4.281000000000033 | -73.253 | -41.37 | -2.924 |
| 4.284000000000034 | -73.541 | -41.542 | -2.963 |
| 4.287000000000034 | -73.829 | -41.716 | -3.002 |
| 4.290000000000034 | -74.119 | -41.889 | -3.042 |
| 4.293000000000034 | -74.409 | -42.063 | -3.081 |
| 4.296000000000034 | -74.699 | -42.238 | -3.121 |
| 4.299000000000034 | -74.991 | -42.413 | -3.161 |
| 4.302000000000034 | -75.283 | -42.588 | -3.201 |
| 4.305000000000034 | -75.575 | -42.764 | -3.241 |
| 4.308000000000034 | -75.869 | -42.94 | -3.281 |
| 4.311000000000034 | -76.162 | -43.116 | -3.322 |
| 4.314000000000035 | -76.457 | -43.293 | -3.363 |
| 4.317000000000035 | -76.752 | -43.471 | -3.404 |
| 4.320000000000035 | -77.048 | -43.649 | -3.445 |
| 4.323000000000035 | -77.344 | -43.827 | -3.486 |
| 4.326000000000035 | -77.641 | -44.006 | -3.527 |
| 4.329000000000035 | -77.939 | -44.185 | -3.569 |
| 4.332000000000035 | -78.238 | -44.364 | -3.611 |
| 4.335000000000035 | -78.537 | -44.545 | -3.653 |
| 4.338000000000035 | -78.836 | -44.725 | -3.695 |
| 4.341000000000035 | -79.137 | -44.906 | -3.738 |
| 4.344000000000036 | -79.438 | -45.087 | -3.78 |
| 4.347000000000036 | -79.739 | -45.269 | -3.823 |
| 4.350000000000036 | -80.042 | -45.451 | -3.866 |
| 4.353000000000036 | -80.344 | -45.634 | -3.909 |
| 4.356000000000036 | -80.648 | -45.817 | -3.952 |
| 4.359000000000036 | -80.952 | -46 | -3.996 |
| 4.362000000000036 | -81.257 | -46.184 | -4.039 |
| 4.365000000000037 | -81.563 | -46.369 | -4.083 |
| 4.368000000000037 | -81.869 | -46.553 | -4.127 |
| 4.371000000000036 | -82.176 | -46.739 | -4.171 |
| 4.374000000000037 | -82.483 | -46.924 | -4.216 |
| 4.377000000000037 | -82.791 | -47.11 | -4.26 |
| 4.380000000000037 | -83.1 | -47.297 | -4.305 |
| 4.383000000000037 | -83.41 | -47.484 | -4.35 |
| 4.386000000000037 | -83.72 | -47.671 | -4.395 |
| 4.389000000000037 | -84.031 | -47.859 | -4.44 |
| 4.392000000000038 | -84.342 | -48.048 | -4.486 |
| 4.395000000000038 | -84.654 | -48.236 | -4.531 |
| 4.398000000000038 | -84.967 | -48.426 | -4.577 |
| 4.401000000000037 | -85.281 | -48.615 | -4.623 |
| 4.404000000000038 | -85.595 | -48.805 | -4.67 |
| 4.407000000000038 | -85.909 | -48.996 | -4.716 |
| 4.410000000000038 | -86.225 | -49.187 | -4.763 |
| 4.413000000000038 | -86.541 | -49.378 | -4.809 |
| 4.416000000000038 | -86.858 | -49.57 | -4.856 |
| 4.419000000000038 | -87.175 | -49.762 | -4.904 |
| 4.422000000000039 | -87.493 | -49.955 | -4.951 |
| 4.425000000000039 | -87.812 | -50.148 | -4.999 |
| 4.428000000000039 | -88.131 | -50.342 | -5.046 |
| 4.43100000000004 | -88.452 | -50.536 | -5.094 |
| 4.43400000000004 | -88.772 | -50.731 | -5.142 |
| 4.43700000000004 | -89.094 | -50.926 | -5.191 |
| 4.44000000000004 | -89.416 | -51.121 | -5.239 |
| 4.44300000000004 | -89.739 | -51.317 | -5.288 |
| 4.44600000000004 | -90.062 | -51.513 | -5.337 |
| 4.44900000000004 | -90.386 | -51.71 | -5.386 |
| 4.45200000000004 | -90.711 | -51.907 | -5.435 |
| 4.45500000000004 | -91.037 | -52.105 | -5.485 |
| 4.45800000000004 | -91.363 | -52.303 | -5.534 |
| 4.46100000000004 | -91.69 | -52.502 | -5.584 |
| 4.46400000000004 | -92.017 | -52.701 | -5.634 |
| 4.46700000000004 | -92.345 | -52.9 | -5.684 |
| 4.47000000000004 | -92.674 | -53.1 | -5.735 |
| 4.47300000000004 | -93.004 | -53.301 | -5.785 |
| 4.47600000000004 | -93.334 | -53.502 | -5.836 |
| 4.47900000000004 | -93.665 | -53.703 | -5.887 |
| 4.482000000000041 | -93.996 | -53.905 | -5.939 |
| 4.485000000000041 | -94.329 | -54.107 | -5.99 |
| 4.488000000000041 | -94.661 | -54.31 | -6.042 |
| 4.491000000000041 | -94.995 | -54.513 | -6.093 |
| 4.494000000000041 | -95.329 | -54.716 | -6.145 |
| 4.497000000000042 | -95.664 | -54.92 | -6.198 |
| 4.500000000000042 | -96 | -55.125 | -6.25 |